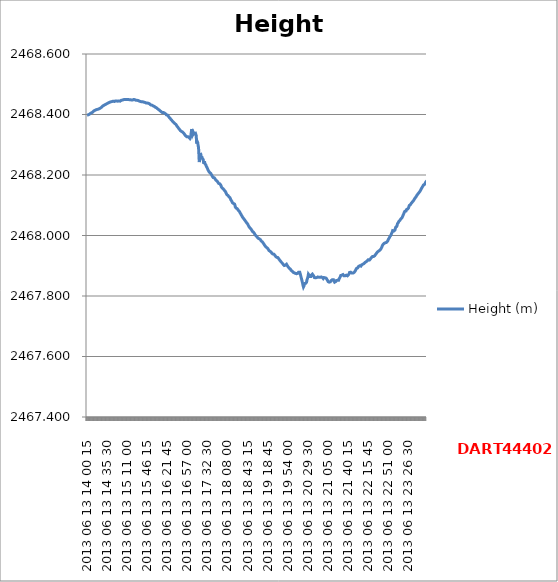
| Category | Height (m) |
|---|---|
| 2013 06 13 14 00 15 | 2468.398 |
| 2013 06 13 14 00 30 | 2468.398 |
| 2013 06 13 14 00 45 | 2468.398 |
| 2013 06 13 14 01 00 | 2468.398 |
| 2013 06 13 14 01 15 | 2468.399 |
| 2013 06 13 14 01 30 | 2468.398 |
| 2013 06 13 14 01 45 | 2468.398 |
| 2013 06 13 14 02 00 | 2468.398 |
| 2013 06 13 14 02 15 | 2468.399 |
| 2013 06 13 14 02 30 | 2468.399 |
| 2013 06 13 14 02 45 | 2468.399 |
| 2013 06 13 14 03 00 | 2468.4 |
| 2013 06 13 14 03 15 | 2468.4 |
| 2013 06 13 14 03 30 | 2468.4 |
| 2013 06 13 14 03 45 | 2468.401 |
| 2013 06 13 14 04 00 | 2468.401 |
| 2013 06 13 14 04 15 | 2468.401 |
| 2013 06 13 14 04 30 | 2468.402 |
| 2013 06 13 14 04 45 | 2468.402 |
| 2013 06 13 14 05 00 | 2468.403 |
| 2013 06 13 14 05 15 | 2468.403 |
| 2013 06 13 14 05 30 | 2468.403 |
| 2013 06 13 14 05 45 | 2468.404 |
| 2013 06 13 14 06 00 | 2468.404 |
| 2013 06 13 14 06 15 | 2468.404 |
| 2013 06 13 14 06 30 | 2468.404 |
| 2013 06 13 14 06 45 | 2468.404 |
| 2013 06 13 14 07 00 | 2468.404 |
| 2013 06 13 14 07 15 | 2468.404 |
| 2013 06 13 14 07 30 | 2468.405 |
| 2013 06 13 14 07 45 | 2468.405 |
| 2013 06 13 14 08 00 | 2468.406 |
| 2013 06 13 14 08 15 | 2468.406 |
| 2013 06 13 14 08 30 | 2468.407 |
| 2013 06 13 14 08 45 | 2468.407 |
| 2013 06 13 14 09 00 | 2468.407 |
| 2013 06 13 14 09 15 | 2468.408 |
| 2013 06 13 14 09 30 | 2468.408 |
| 2013 06 13 14 09 45 | 2468.408 |
| 2013 06 13 14 10 00 | 2468.408 |
| 2013 06 13 14 10 15 | 2468.408 |
| 2013 06 13 14 10 30 | 2468.409 |
| 2013 06 13 14 10 45 | 2468.41 |
| 2013 06 13 14 11 00 | 2468.41 |
| 2013 06 13 14 11 15 | 2468.41 |
| 2013 06 13 14 11 30 | 2468.411 |
| 2013 06 13 14 11 45 | 2468.411 |
| 2013 06 13 14 12 00 | 2468.411 |
| 2013 06 13 14 12 15 | 2468.412 |
| 2013 06 13 14 12 30 | 2468.412 |
| 2013 06 13 14 12 45 | 2468.412 |
| 2013 06 13 14 13 00 | 2468.412 |
| 2013 06 13 14 13 15 | 2468.413 |
| 2013 06 13 14 13 30 | 2468.413 |
| 2013 06 13 14 13 45 | 2468.413 |
| 2013 06 13 14 14 00 | 2468.414 |
| 2013 06 13 14 14 15 | 2468.414 |
| 2013 06 13 14 14 30 | 2468.414 |
| 2013 06 13 14 14 45 | 2468.414 |
| 2013 06 13 14 15 00 | 2468.415 |
| 2013 06 13 14 15 15 | 2468.415 |
| 2013 06 13 14 15 30 | 2468.416 |
| 2013 06 13 14 15 45 | 2468.415 |
| 2013 06 13 14 16 00 | 2468.415 |
| 2013 06 13 14 16 15 | 2468.416 |
| 2013 06 13 14 16 30 | 2468.416 |
| 2013 06 13 14 16 45 | 2468.416 |
| 2013 06 13 14 17 00 | 2468.416 |
| 2013 06 13 14 17 15 | 2468.416 |
| 2013 06 13 14 17 30 | 2468.416 |
| 2013 06 13 14 17 45 | 2468.416 |
| 2013 06 13 14 18 00 | 2468.417 |
| 2013 06 13 14 18 15 | 2468.417 |
| 2013 06 13 14 18 30 | 2468.417 |
| 2013 06 13 14 18 45 | 2468.417 |
| 2013 06 13 14 19 00 | 2468.417 |
| 2013 06 13 14 19 15 | 2468.418 |
| 2013 06 13 14 19 30 | 2468.417 |
| 2013 06 13 14 19 45 | 2468.417 |
| 2013 06 13 14 20 00 | 2468.418 |
| 2013 06 13 14 20 15 | 2468.418 |
| 2013 06 13 14 20 30 | 2468.418 |
| 2013 06 13 14 20 45 | 2468.419 |
| 2013 06 13 14 21 00 | 2468.419 |
| 2013 06 13 14 21 15 | 2468.419 |
| 2013 06 13 14 21 30 | 2468.419 |
| 2013 06 13 14 21 45 | 2468.42 |
| 2013 06 13 14 22 00 | 2468.42 |
| 2013 06 13 14 22 15 | 2468.42 |
| 2013 06 13 14 22 30 | 2468.42 |
| 2013 06 13 14 22 45 | 2468.421 |
| 2013 06 13 14 23 00 | 2468.421 |
| 2013 06 13 14 23 15 | 2468.421 |
| 2013 06 13 14 23 30 | 2468.421 |
| 2013 06 13 14 23 45 | 2468.421 |
| 2013 06 13 14 24 00 | 2468.421 |
| 2013 06 13 14 24 15 | 2468.422 |
| 2013 06 13 14 24 30 | 2468.423 |
| 2013 06 13 14 24 45 | 2468.423 |
| 2013 06 13 14 25 00 | 2468.423 |
| 2013 06 13 14 25 15 | 2468.423 |
| 2013 06 13 14 25 30 | 2468.423 |
| 2013 06 13 14 25 45 | 2468.424 |
| 2013 06 13 14 26 00 | 2468.424 |
| 2013 06 13 14 26 15 | 2468.425 |
| 2013 06 13 14 26 30 | 2468.425 |
| 2013 06 13 14 26 45 | 2468.426 |
| 2013 06 13 14 27 00 | 2468.426 |
| 2013 06 13 14 27 15 | 2468.427 |
| 2013 06 13 14 27 30 | 2468.427 |
| 2013 06 13 14 27 45 | 2468.428 |
| 2013 06 13 14 28 00 | 2468.428 |
| 2013 06 13 14 28 15 | 2468.429 |
| 2013 06 13 14 28 30 | 2468.429 |
| 2013 06 13 14 28 45 | 2468.43 |
| 2013 06 13 14 29 00 | 2468.43 |
| 2013 06 13 14 29 15 | 2468.43 |
| 2013 06 13 14 29 30 | 2468.43 |
| 2013 06 13 14 29 45 | 2468.43 |
| 2013 06 13 14 30 00 | 2468.431 |
| 2013 06 13 14 30 15 | 2468.431 |
| 2013 06 13 14 30 30 | 2468.431 |
| 2013 06 13 14 30 45 | 2468.431 |
| 2013 06 13 14 31 00 | 2468.432 |
| 2013 06 13 14 31 15 | 2468.432 |
| 2013 06 13 14 31 30 | 2468.432 |
| 2013 06 13 14 31 45 | 2468.432 |
| 2013 06 13 14 32 00 | 2468.433 |
| 2013 06 13 14 32 15 | 2468.433 |
| 2013 06 13 14 32 30 | 2468.433 |
| 2013 06 13 14 32 45 | 2468.433 |
| 2013 06 13 14 33 00 | 2468.434 |
| 2013 06 13 14 33 15 | 2468.434 |
| 2013 06 13 14 33 30 | 2468.434 |
| 2013 06 13 14 33 45 | 2468.434 |
| 2013 06 13 14 34 00 | 2468.435 |
| 2013 06 13 14 34 15 | 2468.435 |
| 2013 06 13 14 34 30 | 2468.435 |
| 2013 06 13 14 34 45 | 2468.436 |
| 2013 06 13 14 35 00 | 2468.436 |
| 2013 06 13 14 35 15 | 2468.436 |
| 2013 06 13 14 35 30 | 2468.436 |
| 2013 06 13 14 35 45 | 2468.436 |
| 2013 06 13 14 36 00 | 2468.437 |
| 2013 06 13 14 36 15 | 2468.437 |
| 2013 06 13 14 36 30 | 2468.437 |
| 2013 06 13 14 36 45 | 2468.437 |
| 2013 06 13 14 37 00 | 2468.438 |
| 2013 06 13 14 37 15 | 2468.438 |
| 2013 06 13 14 37 30 | 2468.438 |
| 2013 06 13 14 37 45 | 2468.438 |
| 2013 06 13 14 38 00 | 2468.439 |
| 2013 06 13 14 38 15 | 2468.439 |
| 2013 06 13 14 38 30 | 2468.439 |
| 2013 06 13 14 38 45 | 2468.439 |
| 2013 06 13 14 39 00 | 2468.44 |
| 2013 06 13 14 39 15 | 2468.44 |
| 2013 06 13 14 39 30 | 2468.441 |
| 2013 06 13 14 39 45 | 2468.441 |
| 2013 06 13 14 40 00 | 2468.441 |
| 2013 06 13 14 40 15 | 2468.441 |
| 2013 06 13 14 40 30 | 2468.441 |
| 2013 06 13 14 40 45 | 2468.441 |
| 2013 06 13 14 41 00 | 2468.441 |
| 2013 06 13 14 41 15 | 2468.441 |
| 2013 06 13 14 41 30 | 2468.441 |
| 2013 06 13 14 41 45 | 2468.441 |
| 2013 06 13 14 42 00 | 2468.442 |
| 2013 06 13 14 42 15 | 2468.442 |
| 2013 06 13 14 42 30 | 2468.442 |
| 2013 06 13 14 42 45 | 2468.442 |
| 2013 06 13 14 43 00 | 2468.441 |
| 2013 06 13 14 43 15 | 2468.441 |
| 2013 06 13 14 43 30 | 2468.442 |
| 2013 06 13 14 43 45 | 2468.443 |
| 2013 06 13 14 44 00 | 2468.443 |
| 2013 06 13 14 44 15 | 2468.443 |
| 2013 06 13 14 44 30 | 2468.443 |
| 2013 06 13 14 44 45 | 2468.443 |
| 2013 06 13 14 45 00 | 2468.443 |
| 2013 06 13 14 45 15 | 2468.443 |
| 2013 06 13 14 45 30 | 2468.443 |
| 2013 06 13 14 45 45 | 2468.443 |
| 2013 06 13 14 46 00 | 2468.443 |
| 2013 06 13 14 46 15 | 2468.444 |
| 2013 06 13 14 46 30 | 2468.443 |
| 2013 06 13 14 46 45 | 2468.443 |
| 2013 06 13 14 47 00 | 2468.443 |
| 2013 06 13 14 47 15 | 2468.443 |
| 2013 06 13 14 47 30 | 2468.443 |
| 2013 06 13 14 47 45 | 2468.444 |
| 2013 06 13 14 48 00 | 2468.444 |
| 2013 06 13 14 48 15 | 2468.443 |
| 2013 06 13 14 48 30 | 2468.444 |
| 2013 06 13 14 48 45 | 2468.444 |
| 2013 06 13 14 49 00 | 2468.444 |
| 2013 06 13 14 49 15 | 2468.444 |
| 2013 06 13 14 49 30 | 2468.444 |
| 2013 06 13 14 49 45 | 2468.444 |
| 2013 06 13 14 50 00 | 2468.444 |
| 2013 06 13 14 50 15 | 2468.445 |
| 2013 06 13 14 50 30 | 2468.445 |
| 2013 06 13 14 50 45 | 2468.445 |
| 2013 06 13 14 51 00 | 2468.445 |
| 2013 06 13 14 51 15 | 2468.445 |
| 2013 06 13 14 51 30 | 2468.445 |
| 2013 06 13 14 51 45 | 2468.445 |
| 2013 06 13 14 52 00 | 2468.445 |
| 2013 06 13 14 52 15 | 2468.445 |
| 2013 06 13 14 52 30 | 2468.444 |
| 2013 06 13 14 52 45 | 2468.444 |
| 2013 06 13 14 53 00 | 2468.444 |
| 2013 06 13 14 53 15 | 2468.444 |
| 2013 06 13 14 53 30 | 2468.445 |
| 2013 06 13 14 53 45 | 2468.444 |
| 2013 06 13 14 54 00 | 2468.444 |
| 2013 06 13 14 54 15 | 2468.444 |
| 2013 06 13 14 54 30 | 2468.445 |
| 2013 06 13 14 54 45 | 2468.445 |
| 2013 06 13 14 55 00 | 2468.445 |
| 2013 06 13 14 55 15 | 2468.444 |
| 2013 06 13 14 55 30 | 2468.444 |
| 2013 06 13 14 55 45 | 2468.444 |
| 2013 06 13 14 56 00 | 2468.445 |
| 2013 06 13 14 56 15 | 2468.445 |
| 2013 06 13 14 56 30 | 2468.445 |
| 2013 06 13 14 56 45 | 2468.444 |
| 2013 06 13 14 57 00 | 2468.444 |
| 2013 06 13 14 57 15 | 2468.444 |
| 2013 06 13 14 57 30 | 2468.444 |
| 2013 06 13 14 57 45 | 2468.444 |
| 2013 06 13 14 58 00 | 2468.444 |
| 2013 06 13 14 58 15 | 2468.444 |
| 2013 06 13 14 58 30 | 2468.444 |
| 2013 06 13 14 58 45 | 2468.445 |
| 2013 06 13 14 59 00 | 2468.446 |
| 2013 06 13 14 59 15 | 2468.445 |
| 2013 06 13 14 59 30 | 2468.446 |
| 2013 06 13 14 59 45 | 2468.446 |
| 2013 06 13 15 00 15 | 2468.447 |
| 2013 06 13 15 00 30 | 2468.447 |
| 2013 06 13 15 00 45 | 2468.447 |
| 2013 06 13 15 01 00 | 2468.448 |
| 2013 06 13 15 01 15 | 2468.448 |
| 2013 06 13 15 01 30 | 2468.447 |
| 2013 06 13 15 01 45 | 2468.448 |
| 2013 06 13 15 02 00 | 2468.448 |
| 2013 06 13 15 02 15 | 2468.448 |
| 2013 06 13 15 02 30 | 2468.448 |
| 2013 06 13 15 02 45 | 2468.448 |
| 2013 06 13 15 03 00 | 2468.448 |
| 2013 06 13 15 03 15 | 2468.448 |
| 2013 06 13 15 03 30 | 2468.448 |
| 2013 06 13 15 03 45 | 2468.448 |
| 2013 06 13 15 04 00 | 2468.448 |
| 2013 06 13 15 04 15 | 2468.448 |
| 2013 06 13 15 04 30 | 2468.449 |
| 2013 06 13 15 04 45 | 2468.449 |
| 2013 06 13 15 05 00 | 2468.449 |
| 2013 06 13 15 05 15 | 2468.449 |
| 2013 06 13 15 05 30 | 2468.45 |
| 2013 06 13 15 05 45 | 2468.45 |
| 2013 06 13 15 06 00 | 2468.45 |
| 2013 06 13 15 06 15 | 2468.45 |
| 2013 06 13 15 06 30 | 2468.45 |
| 2013 06 13 15 06 45 | 2468.45 |
| 2013 06 13 15 07 00 | 2468.45 |
| 2013 06 13 15 07 15 | 2468.45 |
| 2013 06 13 15 07 30 | 2468.45 |
| 2013 06 13 15 07 45 | 2468.45 |
| 2013 06 13 15 08 00 | 2468.45 |
| 2013 06 13 15 08 15 | 2468.45 |
| 2013 06 13 15 08 30 | 2468.45 |
| 2013 06 13 15 08 45 | 2468.45 |
| 2013 06 13 15 09 00 | 2468.45 |
| 2013 06 13 15 09 15 | 2468.45 |
| 2013 06 13 15 09 30 | 2468.45 |
| 2013 06 13 15 09 45 | 2468.45 |
| 2013 06 13 15 10 00 | 2468.45 |
| 2013 06 13 15 10 15 | 2468.45 |
| 2013 06 13 15 10 30 | 2468.45 |
| 2013 06 13 15 10 45 | 2468.45 |
| 2013 06 13 15 11 00 | 2468.45 |
| 2013 06 13 15 11 15 | 2468.45 |
| 2013 06 13 15 11 30 | 2468.45 |
| 2013 06 13 15 11 45 | 2468.45 |
| 2013 06 13 15 12 00 | 2468.45 |
| 2013 06 13 15 12 15 | 2468.45 |
| 2013 06 13 15 12 30 | 2468.45 |
| 2013 06 13 15 12 45 | 2468.45 |
| 2013 06 13 15 13 00 | 2468.45 |
| 2013 06 13 15 13 15 | 2468.45 |
| 2013 06 13 15 13 30 | 2468.45 |
| 2013 06 13 15 13 45 | 2468.45 |
| 2013 06 13 15 14 00 | 2468.45 |
| 2013 06 13 15 14 15 | 2468.449 |
| 2013 06 13 15 14 30 | 2468.449 |
| 2013 06 13 15 14 45 | 2468.45 |
| 2013 06 13 15 15 00 | 2468.45 |
| 2013 06 13 15 15 15 | 2468.449 |
| 2013 06 13 15 15 30 | 2468.449 |
| 2013 06 13 15 15 45 | 2468.449 |
| 2013 06 13 15 16 00 | 2468.45 |
| 2013 06 13 15 16 15 | 2468.45 |
| 2013 06 13 15 16 30 | 2468.449 |
| 2013 06 13 15 16 45 | 2468.45 |
| 2013 06 13 15 17 00 | 2468.449 |
| 2013 06 13 15 17 15 | 2468.449 |
| 2013 06 13 15 17 30 | 2468.449 |
| 2013 06 13 15 17 45 | 2468.449 |
| 2013 06 13 15 18 00 | 2468.449 |
| 2013 06 13 15 18 15 | 2468.448 |
| 2013 06 13 15 18 30 | 2468.448 |
| 2013 06 13 15 18 45 | 2468.448 |
| 2013 06 13 15 19 00 | 2468.448 |
| 2013 06 13 15 19 15 | 2468.448 |
| 2013 06 13 15 19 30 | 2468.448 |
| 2013 06 13 15 19 45 | 2468.448 |
| 2013 06 13 15 20 00 | 2468.448 |
| 2013 06 13 15 20 15 | 2468.448 |
| 2013 06 13 15 20 30 | 2468.448 |
| 2013 06 13 15 20 45 | 2468.448 |
| 2013 06 13 15 21 00 | 2468.448 |
| 2013 06 13 15 21 15 | 2468.448 |
| 2013 06 13 15 21 30 | 2468.448 |
| 2013 06 13 15 21 45 | 2468.449 |
| 2013 06 13 15 22 00 | 2468.449 |
| 2013 06 13 15 22 15 | 2468.449 |
| 2013 06 13 15 22 30 | 2468.45 |
| 2013 06 13 15 22 45 | 2468.45 |
| 2013 06 13 15 23 00 | 2468.45 |
| 2013 06 13 15 23 15 | 2468.45 |
| 2013 06 13 15 23 30 | 2468.45 |
| 2013 06 13 15 23 45 | 2468.45 |
| 2013 06 13 15 24 00 | 2468.449 |
| 2013 06 13 15 24 15 | 2468.449 |
| 2013 06 13 15 24 30 | 2468.449 |
| 2013 06 13 15 24 45 | 2468.449 |
| 2013 06 13 15 25 00 | 2468.448 |
| 2013 06 13 15 25 15 | 2468.448 |
| 2013 06 13 15 25 30 | 2468.448 |
| 2013 06 13 15 25 45 | 2468.448 |
| 2013 06 13 15 26 00 | 2468.448 |
| 2013 06 13 15 26 15 | 2468.448 |
| 2013 06 13 15 26 30 | 2468.447 |
| 2013 06 13 15 26 45 | 2468.447 |
| 2013 06 13 15 27 00 | 2468.447 |
| 2013 06 13 15 27 15 | 2468.447 |
| 2013 06 13 15 27 30 | 2468.447 |
| 2013 06 13 15 27 45 | 2468.447 |
| 2013 06 13 15 28 00 | 2468.447 |
| 2013 06 13 15 28 15 | 2468.447 |
| 2013 06 13 15 28 30 | 2468.447 |
| 2013 06 13 15 28 45 | 2468.447 |
| 2013 06 13 15 29 00 | 2468.447 |
| 2013 06 13 15 29 15 | 2468.446 |
| 2013 06 13 15 29 30 | 2468.447 |
| 2013 06 13 15 29 45 | 2468.446 |
| 2013 06 13 15 30 00 | 2468.446 |
| 2013 06 13 15 30 15 | 2468.446 |
| 2013 06 13 15 30 30 | 2468.446 |
| 2013 06 13 15 30 45 | 2468.445 |
| 2013 06 13 15 31 00 | 2468.445 |
| 2013 06 13 15 31 15 | 2468.445 |
| 2013 06 13 15 31 30 | 2468.445 |
| 2013 06 13 15 31 45 | 2468.445 |
| 2013 06 13 15 32 00 | 2468.444 |
| 2013 06 13 15 32 15 | 2468.444 |
| 2013 06 13 15 32 30 | 2468.444 |
| 2013 06 13 15 32 45 | 2468.444 |
| 2013 06 13 15 33 00 | 2468.443 |
| 2013 06 13 15 33 15 | 2468.443 |
| 2013 06 13 15 33 30 | 2468.443 |
| 2013 06 13 15 33 45 | 2468.443 |
| 2013 06 13 15 34 00 | 2468.443 |
| 2013 06 13 15 34 15 | 2468.443 |
| 2013 06 13 15 34 30 | 2468.443 |
| 2013 06 13 15 34 45 | 2468.442 |
| 2013 06 13 15 35 00 | 2468.443 |
| 2013 06 13 15 35 15 | 2468.443 |
| 2013 06 13 15 35 30 | 2468.443 |
| 2013 06 13 15 35 45 | 2468.443 |
| 2013 06 13 15 36 00 | 2468.442 |
| 2013 06 13 15 36 15 | 2468.442 |
| 2013 06 13 15 36 30 | 2468.442 |
| 2013 06 13 15 36 45 | 2468.442 |
| 2013 06 13 15 37 00 | 2468.442 |
| 2013 06 13 15 37 15 | 2468.442 |
| 2013 06 13 15 37 30 | 2468.442 |
| 2013 06 13 15 37 45 | 2468.442 |
| 2013 06 13 15 38 00 | 2468.442 |
| 2013 06 13 15 38 15 | 2468.442 |
| 2013 06 13 15 38 30 | 2468.442 |
| 2013 06 13 15 38 45 | 2468.442 |
| 2013 06 13 15 39 00 | 2468.442 |
| 2013 06 13 15 39 15 | 2468.441 |
| 2013 06 13 15 39 30 | 2468.441 |
| 2013 06 13 15 39 45 | 2468.442 |
| 2013 06 13 15 40 00 | 2468.442 |
| 2013 06 13 15 40 15 | 2468.442 |
| 2013 06 13 15 40 30 | 2468.441 |
| 2013 06 13 15 40 45 | 2468.441 |
| 2013 06 13 15 41 00 | 2468.441 |
| 2013 06 13 15 41 15 | 2468.441 |
| 2013 06 13 15 41 30 | 2468.441 |
| 2013 06 13 15 41 45 | 2468.44 |
| 2013 06 13 15 42 00 | 2468.441 |
| 2013 06 13 15 42 15 | 2468.441 |
| 2013 06 13 15 42 30 | 2468.44 |
| 2013 06 13 15 42 45 | 2468.44 |
| 2013 06 13 15 43 00 | 2468.439 |
| 2013 06 13 15 43 15 | 2468.439 |
| 2013 06 13 15 43 30 | 2468.439 |
| 2013 06 13 15 43 45 | 2468.439 |
| 2013 06 13 15 44 00 | 2468.438 |
| 2013 06 13 15 44 15 | 2468.438 |
| 2013 06 13 15 44 30 | 2468.438 |
| 2013 06 13 15 44 45 | 2468.438 |
| 2013 06 13 15 45 00 | 2468.438 |
| 2013 06 13 15 45 15 | 2468.438 |
| 2013 06 13 15 45 30 | 2468.438 |
| 2013 06 13 15 45 45 | 2468.438 |
| 2013 06 13 15 46 00 | 2468.437 |
| 2013 06 13 15 46 15 | 2468.437 |
| 2013 06 13 15 46 30 | 2468.438 |
| 2013 06 13 15 46 45 | 2468.438 |
| 2013 06 13 15 47 00 | 2468.437 |
| 2013 06 13 15 47 15 | 2468.437 |
| 2013 06 13 15 47 30 | 2468.436 |
| 2013 06 13 15 47 45 | 2468.436 |
| 2013 06 13 15 48 00 | 2468.437 |
| 2013 06 13 15 48 15 | 2468.437 |
| 2013 06 13 15 48 30 | 2468.437 |
| 2013 06 13 15 48 45 | 2468.436 |
| 2013 06 13 15 49 00 | 2468.436 |
| 2013 06 13 15 49 15 | 2468.436 |
| 2013 06 13 15 49 30 | 2468.436 |
| 2013 06 13 15 49 45 | 2468.436 |
| 2013 06 13 15 50 00 | 2468.436 |
| 2013 06 13 15 50 15 | 2468.435 |
| 2013 06 13 15 50 30 | 2468.435 |
| 2013 06 13 15 50 45 | 2468.435 |
| 2013 06 13 15 51 00 | 2468.434 |
| 2013 06 13 15 51 15 | 2468.433 |
| 2013 06 13 15 51 30 | 2468.433 |
| 2013 06 13 15 51 45 | 2468.433 |
| 2013 06 13 15 52 00 | 2468.433 |
| 2013 06 13 15 52 15 | 2468.433 |
| 2013 06 13 15 52 30 | 2468.432 |
| 2013 06 13 15 52 45 | 2468.432 |
| 2013 06 13 15 53 00 | 2468.432 |
| 2013 06 13 15 53 15 | 2468.432 |
| 2013 06 13 15 53 30 | 2468.432 |
| 2013 06 13 15 53 45 | 2468.432 |
| 2013 06 13 15 54 00 | 2468.432 |
| 2013 06 13 15 54 15 | 2468.431 |
| 2013 06 13 15 54 30 | 2468.431 |
| 2013 06 13 15 54 45 | 2468.431 |
| 2013 06 13 15 55 00 | 2468.431 |
| 2013 06 13 15 55 15 | 2468.43 |
| 2013 06 13 15 55 30 | 2468.43 |
| 2013 06 13 15 55 45 | 2468.431 |
| 2013 06 13 15 56 00 | 2468.43 |
| 2013 06 13 15 56 15 | 2468.43 |
| 2013 06 13 15 56 30 | 2468.429 |
| 2013 06 13 15 56 45 | 2468.429 |
| 2013 06 13 15 57 00 | 2468.429 |
| 2013 06 13 15 57 15 | 2468.428 |
| 2013 06 13 15 57 30 | 2468.428 |
| 2013 06 13 15 57 45 | 2468.428 |
| 2013 06 13 15 58 00 | 2468.428 |
| 2013 06 13 15 58 15 | 2468.427 |
| 2013 06 13 15 58 30 | 2468.427 |
| 2013 06 13 15 58 45 | 2468.426 |
| 2013 06 13 15 59 00 | 2468.426 |
| 2013 06 13 15 59 15 | 2468.426 |
| 2013 06 13 15 59 30 | 2468.425 |
| 2013 06 13 15 59 45 | 2468.424 |
| 2013 06 13 16 00 15 | 2468.424 |
| 2013 06 13 16 00 30 | 2468.424 |
| 2013 06 13 16 00 45 | 2468.424 |
| 2013 06 13 16 01 00 | 2468.424 |
| 2013 06 13 16 01 15 | 2468.423 |
| 2013 06 13 16 01 30 | 2468.423 |
| 2013 06 13 16 01 45 | 2468.423 |
| 2013 06 13 16 02 00 | 2468.422 |
| 2013 06 13 16 02 15 | 2468.422 |
| 2013 06 13 16 02 30 | 2468.422 |
| 2013 06 13 16 02 45 | 2468.422 |
| 2013 06 13 16 03 00 | 2468.421 |
| 2013 06 13 16 03 15 | 2468.42 |
| 2013 06 13 16 03 30 | 2468.42 |
| 2013 06 13 16 03 45 | 2468.42 |
| 2013 06 13 16 04 00 | 2468.419 |
| 2013 06 13 16 04 15 | 2468.419 |
| 2013 06 13 16 04 30 | 2468.419 |
| 2013 06 13 16 04 45 | 2468.419 |
| 2013 06 13 16 05 00 | 2468.418 |
| 2013 06 13 16 05 15 | 2468.418 |
| 2013 06 13 16 05 30 | 2468.417 |
| 2013 06 13 16 05 45 | 2468.416 |
| 2013 06 13 16 06 00 | 2468.416 |
| 2013 06 13 16 06 15 | 2468.416 |
| 2013 06 13 16 06 30 | 2468.416 |
| 2013 06 13 16 06 45 | 2468.416 |
| 2013 06 13 16 07 00 | 2468.415 |
| 2013 06 13 16 07 15 | 2468.415 |
| 2013 06 13 16 07 30 | 2468.415 |
| 2013 06 13 16 07 45 | 2468.415 |
| 2013 06 13 16 08 00 | 2468.414 |
| 2013 06 13 16 08 15 | 2468.414 |
| 2013 06 13 16 08 30 | 2468.414 |
| 2013 06 13 16 08 45 | 2468.413 |
| 2013 06 13 16 09 00 | 2468.412 |
| 2013 06 13 16 09 15 | 2468.413 |
| 2013 06 13 16 09 30 | 2468.412 |
| 2013 06 13 16 09 45 | 2468.411 |
| 2013 06 13 16 10 00 | 2468.411 |
| 2013 06 13 16 10 15 | 2468.411 |
| 2013 06 13 16 10 30 | 2468.41 |
| 2013 06 13 16 10 45 | 2468.41 |
| 2013 06 13 16 11 00 | 2468.409 |
| 2013 06 13 16 11 15 | 2468.409 |
| 2013 06 13 16 11 30 | 2468.408 |
| 2013 06 13 16 11 45 | 2468.408 |
| 2013 06 13 16 12 00 | 2468.408 |
| 2013 06 13 16 12 15 | 2468.408 |
| 2013 06 13 16 12 30 | 2468.407 |
| 2013 06 13 16 12 45 | 2468.407 |
| 2013 06 13 16 13 00 | 2468.407 |
| 2013 06 13 16 13 15 | 2468.407 |
| 2013 06 13 16 13 30 | 2468.407 |
| 2013 06 13 16 13 45 | 2468.407 |
| 2013 06 13 16 14 00 | 2468.407 |
| 2013 06 13 16 14 15 | 2468.407 |
| 2013 06 13 16 14 30 | 2468.407 |
| 2013 06 13 16 14 45 | 2468.407 |
| 2013 06 13 16 15 00 | 2468.407 |
| 2013 06 13 16 15 15 | 2468.406 |
| 2013 06 13 16 15 30 | 2468.406 |
| 2013 06 13 16 15 45 | 2468.406 |
| 2013 06 13 16 16 00 | 2468.406 |
| 2013 06 13 16 16 15 | 2468.406 |
| 2013 06 13 16 16 30 | 2468.406 |
| 2013 06 13 16 16 45 | 2468.405 |
| 2013 06 13 16 17 00 | 2468.405 |
| 2013 06 13 16 17 15 | 2468.405 |
| 2013 06 13 16 17 30 | 2468.405 |
| 2013 06 13 16 17 45 | 2468.404 |
| 2013 06 13 16 18 00 | 2468.404 |
| 2013 06 13 16 18 15 | 2468.403 |
| 2013 06 13 16 18 30 | 2468.402 |
| 2013 06 13 16 18 45 | 2468.402 |
| 2013 06 13 16 19 00 | 2468.402 |
| 2013 06 13 16 19 15 | 2468.401 |
| 2013 06 13 16 19 30 | 2468.401 |
| 2013 06 13 16 19 45 | 2468.401 |
| 2013 06 13 16 20 00 | 2468.4 |
| 2013 06 13 16 20 15 | 2468.399 |
| 2013 06 13 16 20 30 | 2468.399 |
| 2013 06 13 16 20 45 | 2468.399 |
| 2013 06 13 16 21 00 | 2468.399 |
| 2013 06 13 16 21 15 | 2468.399 |
| 2013 06 13 16 21 30 | 2468.398 |
| 2013 06 13 16 21 45 | 2468.398 |
| 2013 06 13 16 22 00 | 2468.398 |
| 2013 06 13 16 22 15 | 2468.398 |
| 2013 06 13 16 22 30 | 2468.397 |
| 2013 06 13 16 22 45 | 2468.396 |
| 2013 06 13 16 23 00 | 2468.396 |
| 2013 06 13 16 23 15 | 2468.396 |
| 2013 06 13 16 23 30 | 2468.395 |
| 2013 06 13 16 23 45 | 2468.394 |
| 2013 06 13 16 24 00 | 2468.394 |
| 2013 06 13 16 24 15 | 2468.394 |
| 2013 06 13 16 24 30 | 2468.393 |
| 2013 06 13 16 24 45 | 2468.392 |
| 2013 06 13 16 25 00 | 2468.391 |
| 2013 06 13 16 25 15 | 2468.391 |
| 2013 06 13 16 25 30 | 2468.39 |
| 2013 06 13 16 25 45 | 2468.39 |
| 2013 06 13 16 26 00 | 2468.389 |
| 2013 06 13 16 26 15 | 2468.389 |
| 2013 06 13 16 26 30 | 2468.388 |
| 2013 06 13 16 26 45 | 2468.388 |
| 2013 06 13 16 27 00 | 2468.387 |
| 2013 06 13 16 27 15 | 2468.386 |
| 2013 06 13 16 27 30 | 2468.385 |
| 2013 06 13 16 27 45 | 2468.385 |
| 2013 06 13 16 28 00 | 2468.385 |
| 2013 06 13 16 28 15 | 2468.384 |
| 2013 06 13 16 28 30 | 2468.383 |
| 2013 06 13 16 28 45 | 2468.383 |
| 2013 06 13 16 29 00 | 2468.382 |
| 2013 06 13 16 29 15 | 2468.382 |
| 2013 06 13 16 29 30 | 2468.381 |
| 2013 06 13 16 29 45 | 2468.381 |
| 2013 06 13 16 30 00 | 2468.381 |
| 2013 06 13 16 30 15 | 2468.38 |
| 2013 06 13 16 30 30 | 2468.38 |
| 2013 06 13 16 30 45 | 2468.379 |
| 2013 06 13 16 31 00 | 2468.378 |
| 2013 06 13 16 31 15 | 2468.377 |
| 2013 06 13 16 31 30 | 2468.377 |
| 2013 06 13 16 31 45 | 2468.377 |
| 2013 06 13 16 32 00 | 2468.376 |
| 2013 06 13 16 32 15 | 2468.376 |
| 2013 06 13 16 32 30 | 2468.375 |
| 2013 06 13 16 32 45 | 2468.375 |
| 2013 06 13 16 33 00 | 2468.374 |
| 2013 06 13 16 33 15 | 2468.374 |
| 2013 06 13 16 33 30 | 2468.373 |
| 2013 06 13 16 33 45 | 2468.373 |
| 2013 06 13 16 34 00 | 2468.373 |
| 2013 06 13 16 34 15 | 2468.373 |
| 2013 06 13 16 34 30 | 2468.372 |
| 2013 06 13 16 34 45 | 2468.372 |
| 2013 06 13 16 35 00 | 2468.37 |
| 2013 06 13 16 35 15 | 2468.37 |
| 2013 06 13 16 35 30 | 2468.37 |
| 2013 06 13 16 35 45 | 2468.369 |
| 2013 06 13 16 36 00 | 2468.368 |
| 2013 06 13 16 36 15 | 2468.368 |
| 2013 06 13 16 36 30 | 2468.367 |
| 2013 06 13 16 36 45 | 2468.367 |
| 2013 06 13 16 37 00 | 2468.367 |
| 2013 06 13 16 37 15 | 2468.366 |
| 2013 06 13 16 37 30 | 2468.366 |
| 2013 06 13 16 37 45 | 2468.365 |
| 2013 06 13 16 38 00 | 2468.365 |
| 2013 06 13 16 38 15 | 2468.363 |
| 2013 06 13 16 38 30 | 2468.363 |
| 2013 06 13 16 38 45 | 2468.363 |
| 2013 06 13 16 39 00 | 2468.363 |
| 2013 06 13 16 39 15 | 2468.362 |
| 2013 06 13 16 39 30 | 2468.361 |
| 2013 06 13 16 39 45 | 2468.361 |
| 2013 06 13 16 40 00 | 2468.359 |
| 2013 06 13 16 40 15 | 2468.358 |
| 2013 06 13 16 40 30 | 2468.358 |
| 2013 06 13 16 40 45 | 2468.357 |
| 2013 06 13 16 41 00 | 2468.357 |
| 2013 06 13 16 41 15 | 2468.356 |
| 2013 06 13 16 41 30 | 2468.356 |
| 2013 06 13 16 41 45 | 2468.354 |
| 2013 06 13 16 42 00 | 2468.354 |
| 2013 06 13 16 42 15 | 2468.353 |
| 2013 06 13 16 42 30 | 2468.352 |
| 2013 06 13 16 42 45 | 2468.352 |
| 2013 06 13 16 43 00 | 2468.352 |
| 2013 06 13 16 43 15 | 2468.351 |
| 2013 06 13 16 43 30 | 2468.35 |
| 2013 06 13 16 43 45 | 2468.349 |
| 2013 06 13 16 44 00 | 2468.348 |
| 2013 06 13 16 44 15 | 2468.348 |
| 2013 06 13 16 44 30 | 2468.348 |
| 2013 06 13 16 44 45 | 2468.347 |
| 2013 06 13 16 45 00 | 2468.346 |
| 2013 06 13 16 45 15 | 2468.346 |
| 2013 06 13 16 45 30 | 2468.345 |
| 2013 06 13 16 45 45 | 2468.345 |
| 2013 06 13 16 46 00 | 2468.345 |
| 2013 06 13 16 46 15 | 2468.344 |
| 2013 06 13 16 46 30 | 2468.344 |
| 2013 06 13 16 46 45 | 2468.344 |
| 2013 06 13 16 47 00 | 2468.343 |
| 2013 06 13 16 47 15 | 2468.343 |
| 2013 06 13 16 47 30 | 2468.343 |
| 2013 06 13 16 47 45 | 2468.342 |
| 2013 06 13 16 48 00 | 2468.342 |
| 2013 06 13 16 48 15 | 2468.342 |
| 2013 06 13 16 48 30 | 2468.342 |
| 2013 06 13 16 48 45 | 2468.342 |
| 2013 06 13 16 49 00 | 2468.342 |
| 2013 06 13 16 49 15 | 2468.341 |
| 2013 06 13 16 49 30 | 2468.341 |
| 2013 06 13 16 49 45 | 2468.34 |
| 2013 06 13 16 50 00 | 2468.34 |
| 2013 06 13 16 50 15 | 2468.339 |
| 2013 06 13 16 50 30 | 2468.339 |
| 2013 06 13 16 50 45 | 2468.338 |
| 2013 06 13 16 51 00 | 2468.338 |
| 2013 06 13 16 51 15 | 2468.337 |
| 2013 06 13 16 51 30 | 2468.336 |
| 2013 06 13 16 51 45 | 2468.336 |
| 2013 06 13 16 52 00 | 2468.335 |
| 2013 06 13 16 52 15 | 2468.334 |
| 2013 06 13 16 52 30 | 2468.334 |
| 2013 06 13 16 52 45 | 2468.333 |
| 2013 06 13 16 53 00 | 2468.332 |
| 2013 06 13 16 53 15 | 2468.332 |
| 2013 06 13 16 53 30 | 2468.331 |
| 2013 06 13 16 53 45 | 2468.33 |
| 2013 06 13 16 54 00 | 2468.33 |
| 2013 06 13 16 54 15 | 2468.329 |
| 2013 06 13 16 54 30 | 2468.329 |
| 2013 06 13 16 54 45 | 2468.329 |
| 2013 06 13 16 55 00 | 2468.328 |
| 2013 06 13 16 55 15 | 2468.328 |
| 2013 06 13 16 55 30 | 2468.327 |
| 2013 06 13 16 55 45 | 2468.327 |
| 2013 06 13 16 56 00 | 2468.327 |
| 2013 06 13 16 56 15 | 2468.327 |
| 2013 06 13 16 56 30 | 2468.327 |
| 2013 06 13 16 56 45 | 2468.327 |
| 2013 06 13 16 57 00 | 2468.327 |
| 2013 06 13 16 57 15 | 2468.327 |
| 2013 06 13 16 57 30 | 2468.327 |
| 2013 06 13 16 57 45 | 2468.327 |
| 2013 06 13 16 58 00 | 2468.327 |
| 2013 06 13 16 58 15 | 2468.327 |
| 2013 06 13 16 58 30 | 2468.327 |
| 2013 06 13 16 58 45 | 2468.326 |
| 2013 06 13 16 59 00 | 2468.326 |
| 2013 06 13 16 59 15 | 2468.325 |
| 2013 06 13 16 59 30 | 2468.325 |
| 2013 06 13 16 59 45 | 2468.325 |
| 2013 06 13 17 00 15 | 2468.323 |
| 2013 06 13 17 00 30 | 2468.323 |
| 2013 06 13 17 00 45 | 2468.323 |
| 2013 06 13 17 01 00 | 2468.322 |
| 2013 06 13 17 01 15 | 2468.322 |
| 2013 06 13 17 01 30 | 2468.322 |
| 2013 06 13 17 01 45 | 2468.321 |
| 2013 06 13 17 02 00 | 2468.322 |
| 2013 06 13 17 02 15 | 2468.323 |
| 2013 06 13 17 02 30 | 2468.324 |
| 2013 06 13 17 02 45 | 2468.325 |
| 2013 06 13 17 03 00 | 2468.327 |
| 2013 06 13 17 03 15 | 2468.329 |
| 2013 06 13 17 03 30 | 2468.332 |
| 2013 06 13 17 03 45 | 2468.336 |
| 2013 06 13 17 04 00 | 2468.34 |
| 2013 06 13 17 04 15 | 2468.343 |
| 2013 06 13 17 04 30 | 2468.346 |
| 2013 06 13 17 04 45 | 2468.349 |
| 2013 06 13 17 05 00 | 2468.352 |
| 2013 06 13 17 05 15 | 2468.352 |
| 2013 06 13 17 05 30 | 2468.352 |
| 2013 06 13 17 05 45 | 2468.35 |
| 2013 06 13 17 06 00 | 2468.346 |
| 2013 06 13 17 06 15 | 2468.342 |
| 2013 06 13 17 06 30 | 2468.338 |
| 2013 06 13 17 06 45 | 2468.334 |
| 2013 06 13 17 07 00 | 2468.331 |
| 2013 06 13 17 07 15 | 2468.331 |
| 2013 06 13 17 07 30 | 2468.331 |
| 2013 06 13 17 07 45 | 2468.334 |
| 2013 06 13 17 08 00 | 2468.337 |
| 2013 06 13 17 08 15 | 2468.34 |
| 2013 06 13 17 08 30 | 2468.34 |
| 2013 06 13 17 08 45 | 2468.339 |
| 2013 06 13 17 09 00 | 2468.338 |
| 2013 06 13 17 09 15 | 2468.337 |
| 2013 06 13 17 09 30 | 2468.336 |
| 2013 06 13 17 09 45 | 2468.335 |
| 2013 06 13 17 10 00 | 2468.336 |
| 2013 06 13 17 10 15 | 2468.336 |
| 2013 06 13 17 10 30 | 2468.338 |
| 2013 06 13 17 10 45 | 2468.338 |
| 2013 06 13 17 11 00 | 2468.338 |
| 2013 06 13 17 11 15 | 2468.337 |
| 2013 06 13 17 11 30 | 2468.338 |
| 2013 06 13 17 11 45 | 2468.339 |
| 2013 06 13 17 12 00 | 2468.339 |
| 2013 06 13 17 12 15 | 2468.339 |
| 2013 06 13 17 12 30 | 2468.336 |
| 2013 06 13 17 12 45 | 2468.331 |
| 2013 06 13 17 13 00 | 2468.324 |
| 2013 06 13 17 13 15 | 2468.316 |
| 2013 06 13 17 13 30 | 2468.309 |
| 2013 06 13 17 13 45 | 2468.304 |
| 2013 06 13 17 14 00 | 2468.303 |
| 2013 06 13 17 14 15 | 2468.304 |
| 2013 06 13 17 14 30 | 2468.307 |
| 2013 06 13 17 14 45 | 2468.31 |
| 2013 06 13 17 15 00 | 2468.311 |
| 2013 06 13 17 15 15 | 2468.31 |
| 2013 06 13 17 15 30 | 2468.307 |
| 2013 06 13 17 15 45 | 2468.303 |
| 2013 06 13 17 16 00 | 2468.3 |
| 2013 06 13 17 16 15 | 2468.297 |
| 2013 06 13 17 16 30 | 2468.295 |
| 2013 06 13 17 16 45 | 2468.292 |
| 2013 06 13 17 17 00 | 2468.287 |
| 2013 06 13 17 17 15 | 2468.279 |
| 2013 06 13 17 17 30 | 2468.269 |
| 2013 06 13 17 17 45 | 2468.258 |
| 2013 06 13 17 18 00 | 2468.249 |
| 2013 06 13 17 18 15 | 2468.243 |
| 2013 06 13 17 18 30 | 2468.243 |
| 2013 06 13 17 18 45 | 2468.248 |
| 2013 06 13 17 19 00 | 2468.253 |
| 2013 06 13 17 19 15 | 2468.258 |
| 2013 06 13 17 19 30 | 2468.262 |
| 2013 06 13 17 19 45 | 2468.265 |
| 2013 06 13 17 20 00 | 2468.269 |
| 2013 06 13 17 20 15 | 2468.273 |
| 2013 06 13 17 20 30 | 2468.274 |
| 2013 06 13 17 20 45 | 2468.271 |
| 2013 06 13 17 21 00 | 2468.266 |
| 2013 06 13 17 21 15 | 2468.258 |
| 2013 06 13 17 21 30 | 2468.254 |
| 2013 06 13 17 21 45 | 2468.254 |
| 2013 06 13 17 22 00 | 2468.258 |
| 2013 06 13 17 22 15 | 2468.262 |
| 2013 06 13 17 22 30 | 2468.262 |
| 2013 06 13 17 22 45 | 2468.26 |
| 2013 06 13 17 23 00 | 2468.256 |
| 2013 06 13 17 23 15 | 2468.254 |
| 2013 06 13 17 23 30 | 2468.254 |
| 2013 06 13 17 23 45 | 2468.255 |
| 2013 06 13 17 24 00 | 2468.256 |
| 2013 06 13 17 24 15 | 2468.256 |
| 2013 06 13 17 24 30 | 2468.255 |
| 2013 06 13 17 24 45 | 2468.255 |
| 2013 06 13 17 25 00 | 2468.252 |
| 2013 06 13 17 25 15 | 2468.249 |
| 2013 06 13 17 25 30 | 2468.245 |
| 2013 06 13 17 25 45 | 2468.242 |
| 2013 06 13 17 26 00 | 2468.241 |
| 2013 06 13 17 26 15 | 2468.242 |
| 2013 06 13 17 26 30 | 2468.242 |
| 2013 06 13 17 26 45 | 2468.242 |
| 2013 06 13 17 27 00 | 2468.243 |
| 2013 06 13 17 27 15 | 2468.244 |
| 2013 06 13 17 27 30 | 2468.244 |
| 2013 06 13 17 27 45 | 2468.242 |
| 2013 06 13 17 28 00 | 2468.239 |
| 2013 06 13 17 28 15 | 2468.237 |
| 2013 06 13 17 28 30 | 2468.237 |
| 2013 06 13 17 28 45 | 2468.238 |
| 2013 06 13 17 29 00 | 2468.238 |
| 2013 06 13 17 29 15 | 2468.237 |
| 2013 06 13 17 29 30 | 2468.235 |
| 2013 06 13 17 29 45 | 2468.235 |
| 2013 06 13 17 30 00 | 2468.233 |
| 2013 06 13 17 30 15 | 2468.231 |
| 2013 06 13 17 30 30 | 2468.229 |
| 2013 06 13 17 30 45 | 2468.228 |
| 2013 06 13 17 31 00 | 2468.229 |
| 2013 06 13 17 31 15 | 2468.229 |
| 2013 06 13 17 31 30 | 2468.227 |
| 2013 06 13 17 31 45 | 2468.225 |
| 2013 06 13 17 32 00 | 2468.223 |
| 2013 06 13 17 32 15 | 2468.223 |
| 2013 06 13 17 32 30 | 2468.222 |
| 2013 06 13 17 32 45 | 2468.221 |
| 2013 06 13 17 33 00 | 2468.22 |
| 2013 06 13 17 33 15 | 2468.218 |
| 2013 06 13 17 33 30 | 2468.217 |
| 2013 06 13 17 33 45 | 2468.216 |
| 2013 06 13 17 34 00 | 2468.216 |
| 2013 06 13 17 34 15 | 2468.216 |
| 2013 06 13 17 34 30 | 2468.214 |
| 2013 06 13 17 34 45 | 2468.213 |
| 2013 06 13 17 35 00 | 2468.212 |
| 2013 06 13 17 35 15 | 2468.212 |
| 2013 06 13 17 35 30 | 2468.212 |
| 2013 06 13 17 35 45 | 2468.21 |
| 2013 06 13 17 36 00 | 2468.209 |
| 2013 06 13 17 36 15 | 2468.208 |
| 2013 06 13 17 36 30 | 2468.208 |
| 2013 06 13 17 36 45 | 2468.209 |
| 2013 06 13 17 37 00 | 2468.208 |
| 2013 06 13 17 37 15 | 2468.207 |
| 2013 06 13 17 37 30 | 2468.207 |
| 2013 06 13 17 37 45 | 2468.206 |
| 2013 06 13 17 38 00 | 2468.206 |
| 2013 06 13 17 38 15 | 2468.206 |
| 2013 06 13 17 38 30 | 2468.205 |
| 2013 06 13 17 38 45 | 2468.204 |
| 2013 06 13 17 39 00 | 2468.203 |
| 2013 06 13 17 39 15 | 2468.204 |
| 2013 06 13 17 39 30 | 2468.204 |
| 2013 06 13 17 39 45 | 2468.203 |
| 2013 06 13 17 40 00 | 2468.2 |
| 2013 06 13 17 40 15 | 2468.199 |
| 2013 06 13 17 40 30 | 2468.198 |
| 2013 06 13 17 40 45 | 2468.198 |
| 2013 06 13 17 41 00 | 2468.196 |
| 2013 06 13 17 41 15 | 2468.195 |
| 2013 06 13 17 41 30 | 2468.195 |
| 2013 06 13 17 41 45 | 2468.194 |
| 2013 06 13 17 42 00 | 2468.194 |
| 2013 06 13 17 42 15 | 2468.193 |
| 2013 06 13 17 42 30 | 2468.192 |
| 2013 06 13 17 42 45 | 2468.191 |
| 2013 06 13 17 43 00 | 2468.192 |
| 2013 06 13 17 43 15 | 2468.191 |
| 2013 06 13 17 43 30 | 2468.191 |
| 2013 06 13 17 43 45 | 2468.19 |
| 2013 06 13 17 44 00 | 2468.191 |
| 2013 06 13 17 44 15 | 2468.191 |
| 2013 06 13 17 44 30 | 2468.191 |
| 2013 06 13 17 44 45 | 2468.189 |
| 2013 06 13 17 45 00 | 2468.189 |
| 2013 06 13 17 45 15 | 2468.19 |
| 2013 06 13 17 45 30 | 2468.189 |
| 2013 06 13 17 45 45 | 2468.188 |
| 2013 06 13 17 46 00 | 2468.187 |
| 2013 06 13 17 46 15 | 2468.186 |
| 2013 06 13 17 46 30 | 2468.186 |
| 2013 06 13 17 46 45 | 2468.186 |
| 2013 06 13 17 47 00 | 2468.185 |
| 2013 06 13 17 47 15 | 2468.184 |
| 2013 06 13 17 47 30 | 2468.183 |
| 2013 06 13 17 47 45 | 2468.181 |
| 2013 06 13 17 48 00 | 2468.181 |
| 2013 06 13 17 48 15 | 2468.182 |
| 2013 06 13 17 48 30 | 2468.181 |
| 2013 06 13 17 48 45 | 2468.18 |
| 2013 06 13 17 49 00 | 2468.18 |
| 2013 06 13 17 49 15 | 2468.18 |
| 2013 06 13 17 49 30 | 2468.18 |
| 2013 06 13 17 49 45 | 2468.179 |
| 2013 06 13 17 50 00 | 2468.178 |
| 2013 06 13 17 50 15 | 2468.177 |
| 2013 06 13 17 50 30 | 2468.177 |
| 2013 06 13 17 50 45 | 2468.177 |
| 2013 06 13 17 51 00 | 2468.176 |
| 2013 06 13 17 51 15 | 2468.176 |
| 2013 06 13 17 51 30 | 2468.176 |
| 2013 06 13 17 51 45 | 2468.175 |
| 2013 06 13 17 52 00 | 2468.173 |
| 2013 06 13 17 52 15 | 2468.172 |
| 2013 06 13 17 52 30 | 2468.171 |
| 2013 06 13 17 52 45 | 2468.17 |
| 2013 06 13 17 53 00 | 2468.17 |
| 2013 06 13 17 53 15 | 2468.17 |
| 2013 06 13 17 53 30 | 2468.17 |
| 2013 06 13 17 53 45 | 2468.17 |
| 2013 06 13 17 54 00 | 2468.17 |
| 2013 06 13 17 54 15 | 2468.171 |
| 2013 06 13 17 54 30 | 2468.172 |
| 2013 06 13 17 54 45 | 2468.171 |
| 2013 06 13 17 55 00 | 2468.171 |
| 2013 06 13 17 55 15 | 2468.171 |
| 2013 06 13 17 55 30 | 2468.17 |
| 2013 06 13 17 55 45 | 2468.17 |
| 2013 06 13 17 56 00 | 2468.169 |
| 2013 06 13 17 56 15 | 2468.166 |
| 2013 06 13 17 56 30 | 2468.164 |
| 2013 06 13 17 56 45 | 2468.163 |
| 2013 06 13 17 57 00 | 2468.161 |
| 2013 06 13 17 57 15 | 2468.16 |
| 2013 06 13 17 57 30 | 2468.16 |
| 2013 06 13 17 57 45 | 2468.159 |
| 2013 06 13 17 58 00 | 2468.159 |
| 2013 06 13 17 58 15 | 2468.158 |
| 2013 06 13 17 58 30 | 2468.157 |
| 2013 06 13 17 58 45 | 2468.157 |
| 2013 06 13 17 59 00 | 2468.156 |
| 2013 06 13 17 59 15 | 2468.155 |
| 2013 06 13 17 59 30 | 2468.156 |
| 2013 06 13 17 59 45 | 2468.156 |
| 2013 06 13 18 00 15 | 2468.155 |
| 2013 06 13 18 00 30 | 2468.155 |
| 2013 06 13 18 00 45 | 2468.154 |
| 2013 06 13 18 01 00 | 2468.154 |
| 2013 06 13 18 01 15 | 2468.152 |
| 2013 06 13 18 01 30 | 2468.152 |
| 2013 06 13 18 01 45 | 2468.152 |
| 2013 06 13 18 02 00 | 2468.151 |
| 2013 06 13 18 02 15 | 2468.151 |
| 2013 06 13 18 02 30 | 2468.15 |
| 2013 06 13 18 02 45 | 2468.149 |
| 2013 06 13 18 03 00 | 2468.149 |
| 2013 06 13 18 03 15 | 2468.149 |
| 2013 06 13 18 03 30 | 2468.148 |
| 2013 06 13 18 03 45 | 2468.147 |
| 2013 06 13 18 04 00 | 2468.146 |
| 2013 06 13 18 04 15 | 2468.145 |
| 2013 06 13 18 04 30 | 2468.144 |
| 2013 06 13 18 04 45 | 2468.144 |
| 2013 06 13 18 05 00 | 2468.143 |
| 2013 06 13 18 05 15 | 2468.141 |
| 2013 06 13 18 05 30 | 2468.14 |
| 2013 06 13 18 05 45 | 2468.14 |
| 2013 06 13 18 06 00 | 2468.139 |
| 2013 06 13 18 06 15 | 2468.139 |
| 2013 06 13 18 06 30 | 2468.138 |
| 2013 06 13 18 06 45 | 2468.136 |
| 2013 06 13 18 07 00 | 2468.135 |
| 2013 06 13 18 07 15 | 2468.135 |
| 2013 06 13 18 07 30 | 2468.135 |
| 2013 06 13 18 07 45 | 2468.134 |
| 2013 06 13 18 08 00 | 2468.134 |
| 2013 06 13 18 08 15 | 2468.134 |
| 2013 06 13 18 08 30 | 2468.134 |
| 2013 06 13 18 08 45 | 2468.133 |
| 2013 06 13 18 09 00 | 2468.132 |
| 2013 06 13 18 09 15 | 2468.131 |
| 2013 06 13 18 09 30 | 2468.131 |
| 2013 06 13 18 09 45 | 2468.13 |
| 2013 06 13 18 10 00 | 2468.13 |
| 2013 06 13 18 10 15 | 2468.129 |
| 2013 06 13 18 10 30 | 2468.129 |
| 2013 06 13 18 10 45 | 2468.129 |
| 2013 06 13 18 11 00 | 2468.128 |
| 2013 06 13 18 11 15 | 2468.128 |
| 2013 06 13 18 11 30 | 2468.128 |
| 2013 06 13 18 11 45 | 2468.127 |
| 2013 06 13 18 12 00 | 2468.126 |
| 2013 06 13 18 12 15 | 2468.125 |
| 2013 06 13 18 12 30 | 2468.124 |
| 2013 06 13 18 12 45 | 2468.124 |
| 2013 06 13 18 13 00 | 2468.122 |
| 2013 06 13 18 13 15 | 2468.121 |
| 2013 06 13 18 13 30 | 2468.119 |
| 2013 06 13 18 13 45 | 2468.119 |
| 2013 06 13 18 14 00 | 2468.118 |
| 2013 06 13 18 14 15 | 2468.117 |
| 2013 06 13 18 14 30 | 2468.117 |
| 2013 06 13 18 14 45 | 2468.117 |
| 2013 06 13 18 15 00 | 2468.116 |
| 2013 06 13 18 15 15 | 2468.116 |
| 2013 06 13 18 15 30 | 2468.115 |
| 2013 06 13 18 15 45 | 2468.113 |
| 2013 06 13 18 16 00 | 2468.111 |
| 2013 06 13 18 16 15 | 2468.11 |
| 2013 06 13 18 16 30 | 2468.109 |
| 2013 06 13 18 16 45 | 2468.109 |
| 2013 06 13 18 17 00 | 2468.109 |
| 2013 06 13 18 17 15 | 2468.108 |
| 2013 06 13 18 17 30 | 2468.108 |
| 2013 06 13 18 17 45 | 2468.108 |
| 2013 06 13 18 18 00 | 2468.107 |
| 2013 06 13 18 18 15 | 2468.106 |
| 2013 06 13 18 18 30 | 2468.106 |
| 2013 06 13 18 18 45 | 2468.105 |
| 2013 06 13 18 19 00 | 2468.105 |
| 2013 06 13 18 19 15 | 2468.105 |
| 2013 06 13 18 19 30 | 2468.106 |
| 2013 06 13 18 19 45 | 2468.106 |
| 2013 06 13 18 20 00 | 2468.106 |
| 2013 06 13 18 20 15 | 2468.105 |
| 2013 06 13 18 20 30 | 2468.104 |
| 2013 06 13 18 20 45 | 2468.102 |
| 2013 06 13 18 21 00 | 2468.101 |
| 2013 06 13 18 21 15 | 2468.099 |
| 2013 06 13 18 21 30 | 2468.098 |
| 2013 06 13 18 21 45 | 2468.095 |
| 2013 06 13 18 22 00 | 2468.094 |
| 2013 06 13 18 22 15 | 2468.093 |
| 2013 06 13 18 22 30 | 2468.092 |
| 2013 06 13 18 22 45 | 2468.092 |
| 2013 06 13 18 23 00 | 2468.091 |
| 2013 06 13 18 23 15 | 2468.092 |
| 2013 06 13 18 23 30 | 2468.091 |
| 2013 06 13 18 23 45 | 2468.091 |
| 2013 06 13 18 24 00 | 2468.09 |
| 2013 06 13 18 24 15 | 2468.09 |
| 2013 06 13 18 24 30 | 2468.09 |
| 2013 06 13 18 24 45 | 2468.09 |
| 2013 06 13 18 25 00 | 2468.089 |
| 2013 06 13 18 25 15 | 2468.089 |
| 2013 06 13 18 25 30 | 2468.089 |
| 2013 06 13 18 25 45 | 2468.088 |
| 2013 06 13 18 26 00 | 2468.086 |
| 2013 06 13 18 26 15 | 2468.086 |
| 2013 06 13 18 26 30 | 2468.085 |
| 2013 06 13 18 26 45 | 2468.085 |
| 2013 06 13 18 27 00 | 2468.085 |
| 2013 06 13 18 27 15 | 2468.084 |
| 2013 06 13 18 27 30 | 2468.083 |
| 2013 06 13 18 27 45 | 2468.083 |
| 2013 06 13 18 28 00 | 2468.082 |
| 2013 06 13 18 28 15 | 2468.081 |
| 2013 06 13 18 28 30 | 2468.08 |
| 2013 06 13 18 28 45 | 2468.08 |
| 2013 06 13 18 29 00 | 2468.079 |
| 2013 06 13 18 29 15 | 2468.079 |
| 2013 06 13 18 29 30 | 2468.078 |
| 2013 06 13 18 29 45 | 2468.077 |
| 2013 06 13 18 30 00 | 2468.076 |
| 2013 06 13 18 30 15 | 2468.075 |
| 2013 06 13 18 30 30 | 2468.074 |
| 2013 06 13 18 30 45 | 2468.073 |
| 2013 06 13 18 31 00 | 2468.073 |
| 2013 06 13 18 31 15 | 2468.072 |
| 2013 06 13 18 31 30 | 2468.071 |
| 2013 06 13 18 31 45 | 2468.07 |
| 2013 06 13 18 32 00 | 2468.069 |
| 2013 06 13 18 32 15 | 2468.068 |
| 2013 06 13 18 32 30 | 2468.068 |
| 2013 06 13 18 32 45 | 2468.067 |
| 2013 06 13 18 33 00 | 2468.066 |
| 2013 06 13 18 33 15 | 2468.065 |
| 2013 06 13 18 33 30 | 2468.064 |
| 2013 06 13 18 33 45 | 2468.063 |
| 2013 06 13 18 34 00 | 2468.062 |
| 2013 06 13 18 34 15 | 2468.061 |
| 2013 06 13 18 34 30 | 2468.061 |
| 2013 06 13 18 34 45 | 2468.06 |
| 2013 06 13 18 35 00 | 2468.059 |
| 2013 06 13 18 35 15 | 2468.059 |
| 2013 06 13 18 35 30 | 2468.058 |
| 2013 06 13 18 35 45 | 2468.057 |
| 2013 06 13 18 36 00 | 2468.056 |
| 2013 06 13 18 36 15 | 2468.056 |
| 2013 06 13 18 36 30 | 2468.055 |
| 2013 06 13 18 36 45 | 2468.055 |
| 2013 06 13 18 37 00 | 2468.055 |
| 2013 06 13 18 37 15 | 2468.054 |
| 2013 06 13 18 37 30 | 2468.053 |
| 2013 06 13 18 37 45 | 2468.052 |
| 2013 06 13 18 38 00 | 2468.052 |
| 2013 06 13 18 38 15 | 2468.052 |
| 2013 06 13 18 38 30 | 2468.051 |
| 2013 06 13 18 38 45 | 2468.05 |
| 2013 06 13 18 39 00 | 2468.05 |
| 2013 06 13 18 39 15 | 2468.049 |
| 2013 06 13 18 39 30 | 2468.049 |
| 2013 06 13 18 39 45 | 2468.049 |
| 2013 06 13 18 40 00 | 2468.048 |
| 2013 06 13 18 40 15 | 2468.046 |
| 2013 06 13 18 40 30 | 2468.046 |
| 2013 06 13 18 40 45 | 2468.045 |
| 2013 06 13 18 41 00 | 2468.044 |
| 2013 06 13 18 41 15 | 2468.044 |
| 2013 06 13 18 41 30 | 2468.043 |
| 2013 06 13 18 41 45 | 2468.042 |
| 2013 06 13 18 42 00 | 2468.042 |
| 2013 06 13 18 42 15 | 2468.041 |
| 2013 06 13 18 42 30 | 2468.041 |
| 2013 06 13 18 42 45 | 2468.04 |
| 2013 06 13 18 43 00 | 2468.04 |
| 2013 06 13 18 43 15 | 2468.039 |
| 2013 06 13 18 43 30 | 2468.038 |
| 2013 06 13 18 43 45 | 2468.037 |
| 2013 06 13 18 44 00 | 2468.037 |
| 2013 06 13 18 44 15 | 2468.036 |
| 2013 06 13 18 44 30 | 2468.035 |
| 2013 06 13 18 44 45 | 2468.033 |
| 2013 06 13 18 45 00 | 2468.033 |
| 2013 06 13 18 45 15 | 2468.032 |
| 2013 06 13 18 45 30 | 2468.031 |
| 2013 06 13 18 45 45 | 2468.03 |
| 2013 06 13 18 46 00 | 2468.029 |
| 2013 06 13 18 46 15 | 2468.029 |
| 2013 06 13 18 46 30 | 2468.027 |
| 2013 06 13 18 46 45 | 2468.026 |
| 2013 06 13 18 47 00 | 2468.026 |
| 2013 06 13 18 47 15 | 2468.026 |
| 2013 06 13 18 47 30 | 2468.025 |
| 2013 06 13 18 47 45 | 2468.025 |
| 2013 06 13 18 48 00 | 2468.024 |
| 2013 06 13 18 48 15 | 2468.023 |
| 2013 06 13 18 48 30 | 2468.024 |
| 2013 06 13 18 48 45 | 2468.023 |
| 2013 06 13 18 49 00 | 2468.023 |
| 2013 06 13 18 49 15 | 2468.022 |
| 2013 06 13 18 49 30 | 2468.021 |
| 2013 06 13 18 49 45 | 2468.021 |
| 2013 06 13 18 50 00 | 2468.02 |
| 2013 06 13 18 50 15 | 2468.019 |
| 2013 06 13 18 50 30 | 2468.018 |
| 2013 06 13 18 50 45 | 2468.017 |
| 2013 06 13 18 51 00 | 2468.017 |
| 2013 06 13 18 51 15 | 2468.016 |
| 2013 06 13 18 51 30 | 2468.015 |
| 2013 06 13 18 51 45 | 2468.014 |
| 2013 06 13 18 52 00 | 2468.014 |
| 2013 06 13 18 52 15 | 2468.014 |
| 2013 06 13 18 52 30 | 2468.014 |
| 2013 06 13 18 52 45 | 2468.013 |
| 2013 06 13 18 53 00 | 2468.013 |
| 2013 06 13 18 53 15 | 2468.013 |
| 2013 06 13 18 53 30 | 2468.012 |
| 2013 06 13 18 53 45 | 2468.011 |
| 2013 06 13 18 54 00 | 2468.01 |
| 2013 06 13 18 54 15 | 2468.01 |
| 2013 06 13 18 54 30 | 2468.009 |
| 2013 06 13 18 54 45 | 2468.008 |
| 2013 06 13 18 55 00 | 2468.008 |
| 2013 06 13 18 55 15 | 2468.007 |
| 2013 06 13 18 55 30 | 2468.007 |
| 2013 06 13 18 55 45 | 2468.006 |
| 2013 06 13 18 56 00 | 2468.005 |
| 2013 06 13 18 56 15 | 2468.004 |
| 2013 06 13 18 56 30 | 2468.003 |
| 2013 06 13 18 56 45 | 2468.003 |
| 2013 06 13 18 57 00 | 2468.003 |
| 2013 06 13 18 57 15 | 2468.002 |
| 2013 06 13 18 57 30 | 2468.001 |
| 2013 06 13 18 57 45 | 2468.001 |
| 2013 06 13 18 58 00 | 2468 |
| 2013 06 13 18 58 15 | 2467.999 |
| 2013 06 13 18 58 30 | 2467.999 |
| 2013 06 13 18 58 45 | 2467.999 |
| 2013 06 13 18 59 00 | 2467.998 |
| 2013 06 13 18 59 15 | 2467.997 |
| 2013 06 13 18 59 30 | 2467.996 |
| 2013 06 13 18 59 45 | 2467.996 |
| 2013 06 13 19 00 15 | 2467.995 |
| 2013 06 13 19 00 30 | 2467.994 |
| 2013 06 13 19 00 45 | 2467.993 |
| 2013 06 13 19 01 00 | 2467.993 |
| 2013 06 13 19 01 15 | 2467.993 |
| 2013 06 13 19 01 30 | 2467.992 |
| 2013 06 13 19 01 45 | 2467.992 |
| 2013 06 13 19 02 00 | 2467.992 |
| 2013 06 13 19 02 15 | 2467.991 |
| 2013 06 13 19 02 30 | 2467.99 |
| 2013 06 13 19 02 45 | 2467.989 |
| 2013 06 13 19 03 00 | 2467.989 |
| 2013 06 13 19 03 15 | 2467.989 |
| 2013 06 13 19 03 30 | 2467.99 |
| 2013 06 13 19 03 45 | 2467.99 |
| 2013 06 13 19 04 00 | 2467.99 |
| 2013 06 13 19 04 15 | 2467.989 |
| 2013 06 13 19 04 30 | 2467.989 |
| 2013 06 13 19 04 45 | 2467.989 |
| 2013 06 13 19 05 00 | 2467.988 |
| 2013 06 13 19 05 15 | 2467.988 |
| 2013 06 13 19 05 30 | 2467.987 |
| 2013 06 13 19 05 45 | 2467.987 |
| 2013 06 13 19 06 00 | 2467.986 |
| 2013 06 13 19 06 15 | 2467.986 |
| 2013 06 13 19 06 30 | 2467.984 |
| 2013 06 13 19 06 45 | 2467.984 |
| 2013 06 13 19 07 00 | 2467.983 |
| 2013 06 13 19 07 15 | 2467.983 |
| 2013 06 13 19 07 30 | 2467.982 |
| 2013 06 13 19 07 45 | 2467.982 |
| 2013 06 13 19 08 00 | 2467.981 |
| 2013 06 13 19 08 15 | 2467.981 |
| 2013 06 13 19 08 30 | 2467.981 |
| 2013 06 13 19 08 45 | 2467.98 |
| 2013 06 13 19 09 00 | 2467.979 |
| 2013 06 13 19 09 15 | 2467.979 |
| 2013 06 13 19 09 30 | 2467.979 |
| 2013 06 13 19 09 45 | 2467.978 |
| 2013 06 13 19 10 00 | 2467.977 |
| 2013 06 13 19 10 15 | 2467.977 |
| 2013 06 13 19 10 30 | 2467.976 |
| 2013 06 13 19 10 45 | 2467.976 |
| 2013 06 13 19 11 00 | 2467.975 |
| 2013 06 13 19 11 15 | 2467.975 |
| 2013 06 13 19 11 30 | 2467.975 |
| 2013 06 13 19 11 45 | 2467.974 |
| 2013 06 13 19 12 00 | 2467.973 |
| 2013 06 13 19 12 15 | 2467.972 |
| 2013 06 13 19 12 30 | 2467.972 |
| 2013 06 13 19 12 45 | 2467.971 |
| 2013 06 13 19 13 00 | 2467.97 |
| 2013 06 13 19 13 15 | 2467.969 |
| 2013 06 13 19 13 30 | 2467.968 |
| 2013 06 13 19 13 45 | 2467.968 |
| 2013 06 13 19 14 00 | 2467.968 |
| 2013 06 13 19 14 15 | 2467.967 |
| 2013 06 13 19 14 30 | 2467.966 |
| 2013 06 13 19 14 45 | 2467.965 |
| 2013 06 13 19 15 00 | 2467.964 |
| 2013 06 13 19 15 15 | 2467.964 |
| 2013 06 13 19 15 30 | 2467.963 |
| 2013 06 13 19 15 45 | 2467.963 |
| 2013 06 13 19 16 00 | 2467.963 |
| 2013 06 13 19 16 15 | 2467.962 |
| 2013 06 13 19 16 30 | 2467.962 |
| 2013 06 13 19 16 45 | 2467.961 |
| 2013 06 13 19 17 00 | 2467.961 |
| 2013 06 13 19 17 15 | 2467.961 |
| 2013 06 13 19 17 30 | 2467.96 |
| 2013 06 13 19 17 45 | 2467.96 |
| 2013 06 13 19 18 00 | 2467.959 |
| 2013 06 13 19 18 15 | 2467.959 |
| 2013 06 13 19 18 30 | 2467.959 |
| 2013 06 13 19 18 45 | 2467.958 |
| 2013 06 13 19 19 00 | 2467.957 |
| 2013 06 13 19 19 15 | 2467.956 |
| 2013 06 13 19 19 30 | 2467.956 |
| 2013 06 13 19 19 45 | 2467.955 |
| 2013 06 13 19 20 00 | 2467.954 |
| 2013 06 13 19 20 15 | 2467.954 |
| 2013 06 13 19 20 30 | 2467.953 |
| 2013 06 13 19 20 45 | 2467.952 |
| 2013 06 13 19 21 00 | 2467.951 |
| 2013 06 13 19 21 15 | 2467.951 |
| 2013 06 13 19 21 30 | 2467.951 |
| 2013 06 13 19 21 45 | 2467.95 |
| 2013 06 13 19 22 00 | 2467.95 |
| 2013 06 13 19 22 15 | 2467.95 |
| 2013 06 13 19 22 30 | 2467.95 |
| 2013 06 13 19 22 45 | 2467.949 |
| 2013 06 13 19 23 00 | 2467.948 |
| 2013 06 13 19 23 15 | 2467.948 |
| 2013 06 13 19 23 30 | 2467.948 |
| 2013 06 13 19 23 45 | 2467.947 |
| 2013 06 13 19 24 00 | 2467.947 |
| 2013 06 13 19 24 15 | 2467.946 |
| 2013 06 13 19 24 30 | 2467.946 |
| 2013 06 13 19 24 45 | 2467.946 |
| 2013 06 13 19 25 00 | 2467.945 |
| 2013 06 13 19 25 15 | 2467.944 |
| 2013 06 13 19 25 30 | 2467.944 |
| 2013 06 13 19 25 45 | 2467.943 |
| 2013 06 13 19 26 00 | 2467.942 |
| 2013 06 13 19 26 15 | 2467.94 |
| 2013 06 13 19 26 30 | 2467.939 |
| 2013 06 13 19 26 45 | 2467.939 |
| 2013 06 13 19 27 00 | 2467.939 |
| 2013 06 13 19 27 15 | 2467.939 |
| 2013 06 13 19 27 30 | 2467.939 |
| 2013 06 13 19 27 45 | 2467.939 |
| 2013 06 13 19 28 00 | 2467.939 |
| 2013 06 13 19 28 15 | 2467.939 |
| 2013 06 13 19 28 30 | 2467.94 |
| 2013 06 13 19 28 45 | 2467.94 |
| 2013 06 13 19 29 00 | 2467.94 |
| 2013 06 13 19 29 15 | 2467.94 |
| 2013 06 13 19 29 30 | 2467.939 |
| 2013 06 13 19 29 45 | 2467.939 |
| 2013 06 13 19 30 00 | 2467.938 |
| 2013 06 13 19 30 15 | 2467.938 |
| 2013 06 13 19 30 30 | 2467.937 |
| 2013 06 13 19 30 45 | 2467.936 |
| 2013 06 13 19 31 00 | 2467.936 |
| 2013 06 13 19 31 15 | 2467.935 |
| 2013 06 13 19 31 30 | 2467.935 |
| 2013 06 13 19 31 45 | 2467.934 |
| 2013 06 13 19 32 00 | 2467.933 |
| 2013 06 13 19 32 15 | 2467.933 |
| 2013 06 13 19 32 30 | 2467.933 |
| 2013 06 13 19 32 45 | 2467.932 |
| 2013 06 13 19 33 00 | 2467.931 |
| 2013 06 13 19 33 15 | 2467.931 |
| 2013 06 13 19 33 30 | 2467.93 |
| 2013 06 13 19 33 45 | 2467.93 |
| 2013 06 13 19 34 00 | 2467.93 |
| 2013 06 13 19 34 15 | 2467.929 |
| 2013 06 13 19 34 30 | 2467.928 |
| 2013 06 13 19 34 45 | 2467.928 |
| 2013 06 13 19 35 00 | 2467.928 |
| 2013 06 13 19 35 15 | 2467.928 |
| 2013 06 13 19 35 30 | 2467.928 |
| 2013 06 13 19 35 45 | 2467.928 |
| 2013 06 13 19 36 00 | 2467.927 |
| 2013 06 13 19 36 15 | 2467.927 |
| 2013 06 13 19 36 30 | 2467.928 |
| 2013 06 13 19 36 45 | 2467.927 |
| 2013 06 13 19 37 00 | 2467.927 |
| 2013 06 13 19 37 15 | 2467.926 |
| 2013 06 13 19 37 30 | 2467.926 |
| 2013 06 13 19 37 45 | 2467.925 |
| 2013 06 13 19 38 00 | 2467.924 |
| 2013 06 13 19 38 15 | 2467.923 |
| 2013 06 13 19 38 30 | 2467.923 |
| 2013 06 13 19 38 45 | 2467.922 |
| 2013 06 13 19 39 00 | 2467.922 |
| 2013 06 13 19 39 15 | 2467.921 |
| 2013 06 13 19 39 30 | 2467.92 |
| 2013 06 13 19 39 45 | 2467.919 |
| 2013 06 13 19 40 00 | 2467.919 |
| 2013 06 13 19 40 15 | 2467.919 |
| 2013 06 13 19 40 30 | 2467.919 |
| 2013 06 13 19 40 45 | 2467.918 |
| 2013 06 13 19 41 00 | 2467.917 |
| 2013 06 13 19 41 15 | 2467.916 |
| 2013 06 13 19 41 30 | 2467.915 |
| 2013 06 13 19 41 45 | 2467.914 |
| 2013 06 13 19 42 00 | 2467.914 |
| 2013 06 13 19 42 15 | 2467.913 |
| 2013 06 13 19 42 30 | 2467.913 |
| 2013 06 13 19 42 45 | 2467.912 |
| 2013 06 13 19 43 00 | 2467.912 |
| 2013 06 13 19 43 15 | 2467.911 |
| 2013 06 13 19 43 30 | 2467.91 |
| 2013 06 13 19 43 45 | 2467.91 |
| 2013 06 13 19 44 00 | 2467.91 |
| 2013 06 13 19 44 15 | 2467.91 |
| 2013 06 13 19 44 30 | 2467.909 |
| 2013 06 13 19 44 45 | 2467.909 |
| 2013 06 13 19 45 00 | 2467.908 |
| 2013 06 13 19 45 15 | 2467.907 |
| 2013 06 13 19 45 30 | 2467.907 |
| 2013 06 13 19 45 45 | 2467.906 |
| 2013 06 13 19 46 00 | 2467.905 |
| 2013 06 13 19 46 15 | 2467.905 |
| 2013 06 13 19 46 30 | 2467.905 |
| 2013 06 13 19 46 45 | 2467.904 |
| 2013 06 13 19 47 00 | 2467.903 |
| 2013 06 13 19 47 15 | 2467.902 |
| 2013 06 13 19 47 30 | 2467.902 |
| 2013 06 13 19 47 45 | 2467.902 |
| 2013 06 13 19 48 00 | 2467.901 |
| 2013 06 13 19 48 15 | 2467.901 |
| 2013 06 13 19 48 30 | 2467.9 |
| 2013 06 13 19 48 45 | 2467.901 |
| 2013 06 13 19 49 00 | 2467.9 |
| 2013 06 13 19 49 15 | 2467.901 |
| 2013 06 13 19 49 30 | 2467.901 |
| 2013 06 13 19 49 45 | 2467.901 |
| 2013 06 13 19 50 00 | 2467.902 |
| 2013 06 13 19 50 15 | 2467.902 |
| 2013 06 13 19 50 30 | 2467.903 |
| 2013 06 13 19 50 45 | 2467.904 |
| 2013 06 13 19 51 00 | 2467.904 |
| 2013 06 13 19 51 15 | 2467.905 |
| 2013 06 13 19 51 30 | 2467.905 |
| 2013 06 13 19 51 45 | 2467.905 |
| 2013 06 13 19 52 00 | 2467.905 |
| 2013 06 13 19 52 15 | 2467.904 |
| 2013 06 13 19 52 30 | 2467.903 |
| 2013 06 13 19 52 45 | 2467.903 |
| 2013 06 13 19 53 00 | 2467.903 |
| 2013 06 13 19 53 15 | 2467.902 |
| 2013 06 13 19 53 30 | 2467.9 |
| 2013 06 13 19 53 45 | 2467.899 |
| 2013 06 13 19 54 00 | 2467.899 |
| 2013 06 13 19 54 15 | 2467.899 |
| 2013 06 13 19 54 30 | 2467.898 |
| 2013 06 13 19 54 45 | 2467.897 |
| 2013 06 13 19 55 00 | 2467.896 |
| 2013 06 13 19 55 15 | 2467.896 |
| 2013 06 13 19 55 30 | 2467.895 |
| 2013 06 13 19 55 45 | 2467.895 |
| 2013 06 13 19 56 00 | 2467.894 |
| 2013 06 13 19 56 15 | 2467.894 |
| 2013 06 13 19 56 30 | 2467.893 |
| 2013 06 13 19 56 45 | 2467.892 |
| 2013 06 13 19 57 00 | 2467.891 |
| 2013 06 13 19 57 15 | 2467.891 |
| 2013 06 13 19 57 30 | 2467.891 |
| 2013 06 13 19 57 45 | 2467.89 |
| 2013 06 13 19 58 00 | 2467.89 |
| 2013 06 13 19 58 15 | 2467.889 |
| 2013 06 13 19 58 30 | 2467.889 |
| 2013 06 13 19 58 45 | 2467.889 |
| 2013 06 13 19 59 00 | 2467.888 |
| 2013 06 13 19 59 15 | 2467.888 |
| 2013 06 13 19 59 30 | 2467.887 |
| 2013 06 13 19 59 45 | 2467.887 |
| 2013 06 13 20 00 15 | 2467.885 |
| 2013 06 13 20 00 30 | 2467.885 |
| 2013 06 13 20 00 45 | 2467.885 |
| 2013 06 13 20 01 00 | 2467.885 |
| 2013 06 13 20 01 15 | 2467.884 |
| 2013 06 13 20 01 30 | 2467.882 |
| 2013 06 13 20 01 45 | 2467.882 |
| 2013 06 13 20 02 00 | 2467.882 |
| 2013 06 13 20 02 15 | 2467.882 |
| 2013 06 13 20 02 30 | 2467.882 |
| 2013 06 13 20 02 45 | 2467.881 |
| 2013 06 13 20 03 00 | 2467.88 |
| 2013 06 13 20 03 15 | 2467.88 |
| 2013 06 13 20 03 30 | 2467.88 |
| 2013 06 13 20 03 45 | 2467.879 |
| 2013 06 13 20 04 00 | 2467.879 |
| 2013 06 13 20 04 15 | 2467.879 |
| 2013 06 13 20 04 30 | 2467.879 |
| 2013 06 13 20 04 45 | 2467.878 |
| 2013 06 13 20 05 00 | 2467.877 |
| 2013 06 13 20 05 15 | 2467.877 |
| 2013 06 13 20 05 30 | 2467.877 |
| 2013 06 13 20 05 45 | 2467.877 |
| 2013 06 13 20 06 00 | 2467.877 |
| 2013 06 13 20 06 15 | 2467.876 |
| 2013 06 13 20 06 30 | 2467.876 |
| 2013 06 13 20 06 45 | 2467.875 |
| 2013 06 13 20 07 00 | 2467.874 |
| 2013 06 13 20 07 15 | 2467.874 |
| 2013 06 13 20 07 30 | 2467.874 |
| 2013 06 13 20 07 45 | 2467.875 |
| 2013 06 13 20 08 00 | 2467.875 |
| 2013 06 13 20 08 15 | 2467.876 |
| 2013 06 13 20 08 30 | 2467.876 |
| 2013 06 13 20 08 45 | 2467.876 |
| 2013 06 13 20 09 00 | 2467.876 |
| 2013 06 13 20 09 15 | 2467.875 |
| 2013 06 13 20 09 30 | 2467.875 |
| 2013 06 13 20 09 45 | 2467.874 |
| 2013 06 13 20 10 00 | 2467.874 |
| 2013 06 13 20 10 15 | 2467.874 |
| 2013 06 13 20 10 30 | 2467.874 |
| 2013 06 13 20 10 45 | 2467.874 |
| 2013 06 13 20 11 00 | 2467.874 |
| 2013 06 13 20 11 15 | 2467.874 |
| 2013 06 13 20 11 30 | 2467.875 |
| 2013 06 13 20 11 45 | 2467.875 |
| 2013 06 13 20 12 00 | 2467.875 |
| 2013 06 13 20 12 15 | 2467.876 |
| 2013 06 13 20 12 30 | 2467.876 |
| 2013 06 13 20 12 45 | 2467.877 |
| 2013 06 13 20 13 00 | 2467.878 |
| 2013 06 13 20 13 15 | 2467.878 |
| 2013 06 13 20 13 30 | 2467.879 |
| 2013 06 13 20 13 45 | 2467.88 |
| 2013 06 13 20 14 00 | 2467.88 |
| 2013 06 13 20 14 15 | 2467.88 |
| 2013 06 13 20 14 30 | 2467.881 |
| 2013 06 13 20 14 45 | 2467.881 |
| 2013 06 13 20 15 00 | 2467.881 |
| 2013 06 13 20 15 15 | 2467.88 |
| 2013 06 13 20 15 30 | 2467.879 |
| 2013 06 13 20 15 45 | 2467.878 |
| 2013 06 13 20 16 00 | 2467.876 |
| 2013 06 13 20 16 15 | 2467.874 |
| 2013 06 13 20 16 30 | 2467.872 |
| 2013 06 13 20 16 45 | 2467.87 |
| 2013 06 13 20 17 00 | 2467.869 |
| 2013 06 13 20 17 15 | 2467.867 |
| 2013 06 13 20 17 30 | 2467.865 |
| 2013 06 13 20 17 45 | 2467.863 |
| 2013 06 13 20 18 00 | 2467.862 |
| 2013 06 13 20 18 15 | 2467.86 |
| 2013 06 13 20 18 30 | 2467.858 |
| 2013 06 13 20 18 45 | 2467.856 |
| 2013 06 13 20 19 00 | 2467.854 |
| 2013 06 13 20 19 15 | 2467.852 |
| 2013 06 13 20 19 30 | 2467.851 |
| 2013 06 13 20 19 45 | 2467.848 |
| 2013 06 13 20 20 00 | 2467.846 |
| 2013 06 13 20 20 15 | 2467.844 |
| 2013 06 13 20 20 30 | 2467.842 |
| 2013 06 13 20 20 45 | 2467.84 |
| 2013 06 13 20 21 00 | 2467.838 |
| 2013 06 13 20 21 15 | 2467.835 |
| 2013 06 13 20 21 30 | 2467.833 |
| 2013 06 13 20 21 45 | 2467.832 |
| 2013 06 13 20 22 00 | 2467.83 |
| 2013 06 13 20 22 15 | 2467.83 |
| 2013 06 13 20 22 30 | 2467.83 |
| 2013 06 13 20 22 45 | 2467.831 |
| 2013 06 13 20 23 00 | 2467.834 |
| 2013 06 13 20 23 15 | 2467.835 |
| 2013 06 13 20 23 30 | 2467.838 |
| 2013 06 13 20 23 45 | 2467.84 |
| 2013 06 13 20 24 00 | 2467.841 |
| 2013 06 13 20 24 15 | 2467.842 |
| 2013 06 13 20 24 30 | 2467.841 |
| 2013 06 13 20 24 45 | 2467.841 |
| 2013 06 13 20 25 00 | 2467.841 |
| 2013 06 13 20 25 15 | 2467.841 |
| 2013 06 13 20 25 30 | 2467.841 |
| 2013 06 13 20 25 45 | 2467.841 |
| 2013 06 13 20 26 00 | 2467.842 |
| 2013 06 13 20 26 15 | 2467.841 |
| 2013 06 13 20 26 30 | 2467.84 |
| 2013 06 13 20 26 45 | 2467.839 |
| 2013 06 13 20 27 00 | 2467.84 |
| 2013 06 13 20 27 15 | 2467.843 |
| 2013 06 13 20 27 30 | 2467.846 |
| 2013 06 13 20 27 45 | 2467.849 |
| 2013 06 13 20 28 00 | 2467.852 |
| 2013 06 13 20 28 15 | 2467.854 |
| 2013 06 13 20 28 30 | 2467.854 |
| 2013 06 13 20 28 45 | 2467.855 |
| 2013 06 13 20 29 00 | 2467.857 |
| 2013 06 13 20 29 15 | 2467.859 |
| 2013 06 13 20 29 30 | 2467.862 |
| 2013 06 13 20 29 45 | 2467.863 |
| 2013 06 13 20 30 00 | 2467.865 |
| 2013 06 13 20 30 15 | 2467.867 |
| 2013 06 13 20 30 30 | 2467.869 |
| 2013 06 13 20 30 45 | 2467.872 |
| 2013 06 13 20 31 00 | 2467.874 |
| 2013 06 13 20 31 15 | 2467.873 |
| 2013 06 13 20 31 30 | 2467.872 |
| 2013 06 13 20 31 45 | 2467.87 |
| 2013 06 13 20 32 00 | 2467.869 |
| 2013 06 13 20 32 15 | 2467.868 |
| 2013 06 13 20 32 30 | 2467.868 |
| 2013 06 13 20 32 45 | 2467.867 |
| 2013 06 13 20 33 00 | 2467.866 |
| 2013 06 13 20 33 15 | 2467.865 |
| 2013 06 13 20 33 30 | 2467.865 |
| 2013 06 13 20 33 45 | 2467.865 |
| 2013 06 13 20 34 00 | 2467.865 |
| 2013 06 13 20 34 15 | 2467.863 |
| 2013 06 13 20 34 30 | 2467.863 |
| 2013 06 13 20 34 45 | 2467.863 |
| 2013 06 13 20 35 00 | 2467.864 |
| 2013 06 13 20 35 15 | 2467.865 |
| 2013 06 13 20 35 30 | 2467.867 |
| 2013 06 13 20 35 45 | 2467.868 |
| 2013 06 13 20 36 00 | 2467.869 |
| 2013 06 13 20 36 15 | 2467.87 |
| 2013 06 13 20 36 30 | 2467.871 |
| 2013 06 13 20 36 45 | 2467.871 |
| 2013 06 13 20 37 00 | 2467.871 |
| 2013 06 13 20 37 15 | 2467.871 |
| 2013 06 13 20 37 30 | 2467.871 |
| 2013 06 13 20 37 45 | 2467.872 |
| 2013 06 13 20 38 00 | 2467.871 |
| 2013 06 13 20 38 15 | 2467.871 |
| 2013 06 13 20 38 30 | 2467.872 |
| 2013 06 13 20 38 45 | 2467.871 |
| 2013 06 13 20 39 00 | 2467.869 |
| 2013 06 13 20 39 15 | 2467.868 |
| 2013 06 13 20 39 30 | 2467.867 |
| 2013 06 13 20 39 45 | 2467.867 |
| 2013 06 13 20 40 00 | 2467.866 |
| 2013 06 13 20 40 15 | 2467.866 |
| 2013 06 13 20 40 30 | 2467.865 |
| 2013 06 13 20 40 45 | 2467.864 |
| 2013 06 13 20 41 00 | 2467.863 |
| 2013 06 13 20 41 15 | 2467.861 |
| 2013 06 13 20 41 30 | 2467.861 |
| 2013 06 13 20 41 45 | 2467.861 |
| 2013 06 13 20 42 00 | 2467.861 |
| 2013 06 13 20 42 15 | 2467.861 |
| 2013 06 13 20 42 30 | 2467.861 |
| 2013 06 13 20 42 45 | 2467.861 |
| 2013 06 13 20 43 00 | 2467.861 |
| 2013 06 13 20 43 15 | 2467.86 |
| 2013 06 13 20 43 30 | 2467.859 |
| 2013 06 13 20 43 45 | 2467.859 |
| 2013 06 13 20 44 00 | 2467.859 |
| 2013 06 13 20 44 15 | 2467.86 |
| 2013 06 13 20 44 30 | 2467.86 |
| 2013 06 13 20 44 45 | 2467.86 |
| 2013 06 13 20 45 00 | 2467.861 |
| 2013 06 13 20 45 15 | 2467.861 |
| 2013 06 13 20 45 30 | 2467.861 |
| 2013 06 13 20 45 45 | 2467.861 |
| 2013 06 13 20 46 00 | 2467.862 |
| 2013 06 13 20 46 15 | 2467.863 |
| 2013 06 13 20 46 30 | 2467.863 |
| 2013 06 13 20 46 45 | 2467.863 |
| 2013 06 13 20 47 00 | 2467.863 |
| 2013 06 13 20 47 15 | 2467.863 |
| 2013 06 13 20 47 30 | 2467.863 |
| 2013 06 13 20 47 45 | 2467.864 |
| 2013 06 13 20 48 00 | 2467.864 |
| 2013 06 13 20 48 15 | 2467.864 |
| 2013 06 13 20 48 30 | 2467.863 |
| 2013 06 13 20 48 45 | 2467.863 |
| 2013 06 13 20 49 00 | 2467.862 |
| 2013 06 13 20 49 15 | 2467.862 |
| 2013 06 13 20 49 30 | 2467.861 |
| 2013 06 13 20 49 45 | 2467.861 |
| 2013 06 13 20 50 00 | 2467.861 |
| 2013 06 13 20 50 15 | 2467.862 |
| 2013 06 13 20 50 30 | 2467.862 |
| 2013 06 13 20 50 45 | 2467.862 |
| 2013 06 13 20 51 00 | 2467.862 |
| 2013 06 13 20 51 15 | 2467.862 |
| 2013 06 13 20 51 30 | 2467.862 |
| 2013 06 13 20 51 45 | 2467.862 |
| 2013 06 13 20 52 00 | 2467.862 |
| 2013 06 13 20 52 15 | 2467.862 |
| 2013 06 13 20 52 30 | 2467.862 |
| 2013 06 13 20 52 45 | 2467.862 |
| 2013 06 13 20 53 00 | 2467.862 |
| 2013 06 13 20 53 15 | 2467.863 |
| 2013 06 13 20 53 30 | 2467.863 |
| 2013 06 13 20 53 45 | 2467.864 |
| 2013 06 13 20 54 00 | 2467.864 |
| 2013 06 13 20 54 15 | 2467.864 |
| 2013 06 13 20 54 30 | 2467.863 |
| 2013 06 13 20 54 45 | 2467.863 |
| 2013 06 13 20 55 00 | 2467.862 |
| 2013 06 13 20 55 15 | 2467.861 |
| 2013 06 13 20 55 30 | 2467.861 |
| 2013 06 13 20 55 45 | 2467.86 |
| 2013 06 13 20 56 00 | 2467.86 |
| 2013 06 13 20 56 15 | 2467.859 |
| 2013 06 13 20 56 30 | 2467.859 |
| 2013 06 13 20 56 45 | 2467.858 |
| 2013 06 13 20 57 00 | 2467.858 |
| 2013 06 13 20 57 15 | 2467.859 |
| 2013 06 13 20 57 30 | 2467.86 |
| 2013 06 13 20 57 45 | 2467.86 |
| 2013 06 13 20 58 00 | 2467.861 |
| 2013 06 13 20 58 15 | 2467.862 |
| 2013 06 13 20 58 30 | 2467.862 |
| 2013 06 13 20 58 45 | 2467.862 |
| 2013 06 13 20 59 00 | 2467.862 |
| 2013 06 13 20 59 15 | 2467.861 |
| 2013 06 13 20 59 30 | 2467.861 |
| 2013 06 13 20 59 45 | 2467.86 |
| 2013 06 13 21 00 15 | 2467.86 |
| 2013 06 13 21 00 30 | 2467.86 |
| 2013 06 13 21 00 45 | 2467.861 |
| 2013 06 13 21 01 00 | 2467.862 |
| 2013 06 13 21 01 15 | 2467.862 |
| 2013 06 13 21 01 30 | 2467.861 |
| 2013 06 13 21 01 45 | 2467.86 |
| 2013 06 13 21 02 00 | 2467.86 |
| 2013 06 13 21 02 15 | 2467.859 |
| 2013 06 13 21 02 30 | 2467.858 |
| 2013 06 13 21 02 45 | 2467.857 |
| 2013 06 13 21 03 00 | 2467.856 |
| 2013 06 13 21 03 15 | 2467.856 |
| 2013 06 13 21 03 30 | 2467.855 |
| 2013 06 13 21 03 45 | 2467.855 |
| 2013 06 13 21 04 00 | 2467.854 |
| 2013 06 13 21 04 15 | 2467.853 |
| 2013 06 13 21 04 30 | 2467.852 |
| 2013 06 13 21 04 45 | 2467.851 |
| 2013 06 13 21 05 00 | 2467.85 |
| 2013 06 13 21 05 15 | 2467.849 |
| 2013 06 13 21 05 30 | 2467.848 |
| 2013 06 13 21 05 45 | 2467.847 |
| 2013 06 13 21 06 00 | 2467.847 |
| 2013 06 13 21 06 15 | 2467.847 |
| 2013 06 13 21 06 30 | 2467.846 |
| 2013 06 13 21 06 45 | 2467.846 |
| 2013 06 13 21 07 00 | 2467.846 |
| 2013 06 13 21 07 15 | 2467.846 |
| 2013 06 13 21 07 30 | 2467.846 |
| 2013 06 13 21 07 45 | 2467.847 |
| 2013 06 13 21 08 00 | 2467.847 |
| 2013 06 13 21 08 15 | 2467.848 |
| 2013 06 13 21 08 30 | 2467.848 |
| 2013 06 13 21 08 45 | 2467.848 |
| 2013 06 13 21 09 00 | 2467.847 |
| 2013 06 13 21 09 15 | 2467.847 |
| 2013 06 13 21 09 30 | 2467.847 |
| 2013 06 13 21 09 45 | 2467.847 |
| 2013 06 13 21 10 00 | 2467.848 |
| 2013 06 13 21 10 15 | 2467.848 |
| 2013 06 13 21 10 30 | 2467.849 |
| 2013 06 13 21 10 45 | 2467.849 |
| 2013 06 13 21 11 00 | 2467.851 |
| 2013 06 13 21 11 15 | 2467.851 |
| 2013 06 13 21 11 30 | 2467.852 |
| 2013 06 13 21 11 45 | 2467.852 |
| 2013 06 13 21 12 00 | 2467.852 |
| 2013 06 13 21 12 15 | 2467.852 |
| 2013 06 13 21 12 30 | 2467.852 |
| 2013 06 13 21 12 45 | 2467.853 |
| 2013 06 13 21 13 00 | 2467.854 |
| 2013 06 13 21 13 15 | 2467.855 |
| 2013 06 13 21 13 30 | 2467.856 |
| 2013 06 13 21 13 45 | 2467.856 |
| 2013 06 13 21 14 00 | 2467.855 |
| 2013 06 13 21 14 15 | 2467.854 |
| 2013 06 13 21 14 30 | 2467.854 |
| 2013 06 13 21 14 45 | 2467.854 |
| 2013 06 13 21 15 00 | 2467.854 |
| 2013 06 13 21 15 15 | 2467.852 |
| 2013 06 13 21 15 30 | 2467.851 |
| 2013 06 13 21 15 45 | 2467.85 |
| 2013 06 13 21 16 00 | 2467.849 |
| 2013 06 13 21 16 15 | 2467.848 |
| 2013 06 13 21 16 30 | 2467.847 |
| 2013 06 13 21 16 45 | 2467.847 |
| 2013 06 13 21 17 00 | 2467.846 |
| 2013 06 13 21 17 15 | 2467.845 |
| 2013 06 13 21 17 30 | 2467.844 |
| 2013 06 13 21 17 45 | 2467.844 |
| 2013 06 13 21 18 00 | 2467.845 |
| 2013 06 13 21 18 15 | 2467.845 |
| 2013 06 13 21 18 30 | 2467.847 |
| 2013 06 13 21 18 45 | 2467.848 |
| 2013 06 13 21 19 00 | 2467.848 |
| 2013 06 13 21 19 15 | 2467.849 |
| 2013 06 13 21 19 30 | 2467.85 |
| 2013 06 13 21 19 45 | 2467.85 |
| 2013 06 13 21 20 00 | 2467.851 |
| 2013 06 13 21 20 15 | 2467.851 |
| 2013 06 13 21 20 30 | 2467.851 |
| 2013 06 13 21 20 45 | 2467.85 |
| 2013 06 13 21 21 00 | 2467.849 |
| 2013 06 13 21 21 15 | 2467.85 |
| 2013 06 13 21 21 30 | 2467.85 |
| 2013 06 13 21 21 45 | 2467.851 |
| 2013 06 13 21 22 00 | 2467.852 |
| 2013 06 13 21 22 15 | 2467.854 |
| 2013 06 13 21 22 30 | 2467.854 |
| 2013 06 13 21 22 45 | 2467.853 |
| 2013 06 13 21 23 00 | 2467.853 |
| 2013 06 13 21 23 15 | 2467.853 |
| 2013 06 13 21 23 30 | 2467.853 |
| 2013 06 13 21 23 45 | 2467.852 |
| 2013 06 13 21 24 00 | 2467.852 |
| 2013 06 13 21 24 15 | 2467.853 |
| 2013 06 13 21 24 30 | 2467.854 |
| 2013 06 13 21 24 45 | 2467.856 |
| 2013 06 13 21 25 00 | 2467.856 |
| 2013 06 13 21 25 15 | 2467.857 |
| 2013 06 13 21 25 30 | 2467.858 |
| 2013 06 13 21 25 45 | 2467.859 |
| 2013 06 13 21 26 00 | 2467.86 |
| 2013 06 13 21 26 15 | 2467.861 |
| 2013 06 13 21 26 30 | 2467.862 |
| 2013 06 13 21 26 45 | 2467.863 |
| 2013 06 13 21 27 00 | 2467.864 |
| 2013 06 13 21 27 15 | 2467.865 |
| 2013 06 13 21 27 30 | 2467.867 |
| 2013 06 13 21 27 45 | 2467.868 |
| 2013 06 13 21 28 00 | 2467.869 |
| 2013 06 13 21 28 15 | 2467.87 |
| 2013 06 13 21 28 30 | 2467.87 |
| 2013 06 13 21 28 45 | 2467.87 |
| 2013 06 13 21 29 00 | 2467.87 |
| 2013 06 13 21 29 15 | 2467.87 |
| 2013 06 13 21 29 30 | 2467.87 |
| 2013 06 13 21 29 45 | 2467.869 |
| 2013 06 13 21 30 00 | 2467.869 |
| 2013 06 13 21 30 15 | 2467.869 |
| 2013 06 13 21 30 30 | 2467.87 |
| 2013 06 13 21 30 45 | 2467.87 |
| 2013 06 13 21 31 00 | 2467.87 |
| 2013 06 13 21 31 15 | 2467.871 |
| 2013 06 13 21 31 30 | 2467.871 |
| 2013 06 13 21 31 45 | 2467.871 |
| 2013 06 13 21 32 00 | 2467.871 |
| 2013 06 13 21 32 15 | 2467.87 |
| 2013 06 13 21 32 30 | 2467.869 |
| 2013 06 13 21 32 45 | 2467.869 |
| 2013 06 13 21 33 00 | 2467.868 |
| 2013 06 13 21 33 15 | 2467.868 |
| 2013 06 13 21 33 30 | 2467.867 |
| 2013 06 13 21 33 45 | 2467.867 |
| 2013 06 13 21 34 00 | 2467.867 |
| 2013 06 13 21 34 15 | 2467.866 |
| 2013 06 13 21 34 30 | 2467.865 |
| 2013 06 13 21 34 45 | 2467.865 |
| 2013 06 13 21 35 00 | 2467.867 |
| 2013 06 13 21 35 15 | 2467.867 |
| 2013 06 13 21 35 30 | 2467.867 |
| 2013 06 13 21 35 45 | 2467.867 |
| 2013 06 13 21 36 00 | 2467.867 |
| 2013 06 13 21 36 15 | 2467.868 |
| 2013 06 13 21 36 30 | 2467.869 |
| 2013 06 13 21 36 45 | 2467.868 |
| 2013 06 13 21 37 00 | 2467.868 |
| 2013 06 13 21 37 15 | 2467.869 |
| 2013 06 13 21 37 30 | 2467.869 |
| 2013 06 13 21 37 45 | 2467.869 |
| 2013 06 13 21 38 00 | 2467.869 |
| 2013 06 13 21 38 15 | 2467.869 |
| 2013 06 13 21 38 30 | 2467.869 |
| 2013 06 13 21 38 45 | 2467.869 |
| 2013 06 13 21 39 00 | 2467.868 |
| 2013 06 13 21 39 15 | 2467.868 |
| 2013 06 13 21 39 30 | 2467.867 |
| 2013 06 13 21 39 45 | 2467.867 |
| 2013 06 13 21 40 00 | 2467.867 |
| 2013 06 13 21 40 15 | 2467.867 |
| 2013 06 13 21 40 30 | 2467.868 |
| 2013 06 13 21 40 45 | 2467.868 |
| 2013 06 13 21 41 00 | 2467.869 |
| 2013 06 13 21 41 15 | 2467.87 |
| 2013 06 13 21 41 30 | 2467.87 |
| 2013 06 13 21 41 45 | 2467.872 |
| 2013 06 13 21 42 00 | 2467.873 |
| 2013 06 13 21 42 15 | 2467.873 |
| 2013 06 13 21 42 30 | 2467.874 |
| 2013 06 13 21 42 45 | 2467.875 |
| 2013 06 13 21 43 00 | 2467.876 |
| 2013 06 13 21 43 15 | 2467.878 |
| 2013 06 13 21 43 30 | 2467.878 |
| 2013 06 13 21 43 45 | 2467.878 |
| 2013 06 13 21 44 00 | 2467.877 |
| 2013 06 13 21 44 15 | 2467.877 |
| 2013 06 13 21 44 30 | 2467.878 |
| 2013 06 13 21 44 45 | 2467.879 |
| 2013 06 13 21 45 00 | 2467.879 |
| 2013 06 13 21 45 15 | 2467.879 |
| 2013 06 13 21 45 30 | 2467.88 |
| 2013 06 13 21 45 45 | 2467.88 |
| 2013 06 13 21 46 00 | 2467.88 |
| 2013 06 13 21 46 15 | 2467.88 |
| 2013 06 13 21 46 30 | 2467.879 |
| 2013 06 13 21 46 45 | 2467.878 |
| 2013 06 13 21 47 00 | 2467.876 |
| 2013 06 13 21 47 15 | 2467.876 |
| 2013 06 13 21 47 30 | 2467.876 |
| 2013 06 13 21 47 45 | 2467.876 |
| 2013 06 13 21 48 00 | 2467.877 |
| 2013 06 13 21 48 15 | 2467.877 |
| 2013 06 13 21 48 30 | 2467.876 |
| 2013 06 13 21 48 45 | 2467.876 |
| 2013 06 13 21 49 00 | 2467.876 |
| 2013 06 13 21 49 15 | 2467.876 |
| 2013 06 13 21 49 30 | 2467.876 |
| 2013 06 13 21 49 45 | 2467.876 |
| 2013 06 13 21 50 00 | 2467.876 |
| 2013 06 13 21 50 15 | 2467.876 |
| 2013 06 13 21 50 30 | 2467.876 |
| 2013 06 13 21 50 45 | 2467.876 |
| 2013 06 13 21 51 00 | 2467.877 |
| 2013 06 13 21 51 15 | 2467.878 |
| 2013 06 13 21 51 30 | 2467.878 |
| 2013 06 13 21 51 45 | 2467.879 |
| 2013 06 13 21 52 00 | 2467.88 |
| 2013 06 13 21 52 15 | 2467.88 |
| 2013 06 13 21 52 30 | 2467.881 |
| 2013 06 13 21 52 45 | 2467.881 |
| 2013 06 13 21 53 00 | 2467.882 |
| 2013 06 13 21 53 15 | 2467.883 |
| 2013 06 13 21 53 30 | 2467.883 |
| 2013 06 13 21 53 45 | 2467.884 |
| 2013 06 13 21 54 00 | 2467.885 |
| 2013 06 13 21 54 15 | 2467.887 |
| 2013 06 13 21 54 30 | 2467.888 |
| 2013 06 13 21 54 45 | 2467.889 |
| 2013 06 13 21 55 00 | 2467.889 |
| 2013 06 13 21 55 15 | 2467.89 |
| 2013 06 13 21 55 30 | 2467.891 |
| 2013 06 13 21 55 45 | 2467.892 |
| 2013 06 13 21 56 00 | 2467.893 |
| 2013 06 13 21 56 15 | 2467.893 |
| 2013 06 13 21 56 30 | 2467.893 |
| 2013 06 13 21 56 45 | 2467.893 |
| 2013 06 13 21 57 00 | 2467.893 |
| 2013 06 13 21 57 15 | 2467.893 |
| 2013 06 13 21 57 30 | 2467.893 |
| 2013 06 13 21 57 45 | 2467.893 |
| 2013 06 13 21 58 00 | 2467.893 |
| 2013 06 13 21 58 15 | 2467.894 |
| 2013 06 13 21 58 30 | 2467.894 |
| 2013 06 13 21 58 45 | 2467.895 |
| 2013 06 13 21 59 00 | 2467.896 |
| 2013 06 13 21 59 15 | 2467.898 |
| 2013 06 13 21 59 30 | 2467.898 |
| 2013 06 13 21 59 45 | 2467.898 |
| 2013 06 13 22 00 15 | 2467.899 |
| 2013 06 13 22 00 30 | 2467.9 |
| 2013 06 13 22 00 45 | 2467.9 |
| 2013 06 13 22 01 00 | 2467.9 |
| 2013 06 13 22 01 15 | 2467.901 |
| 2013 06 13 22 01 30 | 2467.9 |
| 2013 06 13 22 01 45 | 2467.899 |
| 2013 06 13 22 02 00 | 2467.899 |
| 2013 06 13 22 02 15 | 2467.899 |
| 2013 06 13 22 02 30 | 2467.899 |
| 2013 06 13 22 02 45 | 2467.899 |
| 2013 06 13 22 03 00 | 2467.899 |
| 2013 06 13 22 03 15 | 2467.899 |
| 2013 06 13 22 03 30 | 2467.899 |
| 2013 06 13 22 03 45 | 2467.9 |
| 2013 06 13 22 04 00 | 2467.9 |
| 2013 06 13 22 04 15 | 2467.901 |
| 2013 06 13 22 04 30 | 2467.902 |
| 2013 06 13 22 04 45 | 2467.903 |
| 2013 06 13 22 05 00 | 2467.904 |
| 2013 06 13 22 05 15 | 2467.905 |
| 2013 06 13 22 05 30 | 2467.905 |
| 2013 06 13 22 05 45 | 2467.904 |
| 2013 06 13 22 06 00 | 2467.905 |
| 2013 06 13 22 06 15 | 2467.904 |
| 2013 06 13 22 06 30 | 2467.905 |
| 2013 06 13 22 06 45 | 2467.905 |
| 2013 06 13 22 07 00 | 2467.904 |
| 2013 06 13 22 07 15 | 2467.905 |
| 2013 06 13 22 07 30 | 2467.905 |
| 2013 06 13 22 07 45 | 2467.906 |
| 2013 06 13 22 08 00 | 2467.907 |
| 2013 06 13 22 08 15 | 2467.907 |
| 2013 06 13 22 08 30 | 2467.907 |
| 2013 06 13 22 08 45 | 2467.907 |
| 2013 06 13 22 09 00 | 2467.908 |
| 2013 06 13 22 09 15 | 2467.909 |
| 2013 06 13 22 09 30 | 2467.909 |
| 2013 06 13 22 09 45 | 2467.909 |
| 2013 06 13 22 10 00 | 2467.91 |
| 2013 06 13 22 10 15 | 2467.91 |
| 2013 06 13 22 10 30 | 2467.911 |
| 2013 06 13 22 10 45 | 2467.911 |
| 2013 06 13 22 11 00 | 2467.911 |
| 2013 06 13 22 11 15 | 2467.911 |
| 2013 06 13 22 11 30 | 2467.911 |
| 2013 06 13 22 11 45 | 2467.911 |
| 2013 06 13 22 12 00 | 2467.912 |
| 2013 06 13 22 12 15 | 2467.913 |
| 2013 06 13 22 12 30 | 2467.913 |
| 2013 06 13 22 12 45 | 2467.914 |
| 2013 06 13 22 13 00 | 2467.914 |
| 2013 06 13 22 13 15 | 2467.914 |
| 2013 06 13 22 13 30 | 2467.914 |
| 2013 06 13 22 13 45 | 2467.915 |
| 2013 06 13 22 14 00 | 2467.916 |
| 2013 06 13 22 14 15 | 2467.916 |
| 2013 06 13 22 14 30 | 2467.916 |
| 2013 06 13 22 14 45 | 2467.917 |
| 2013 06 13 22 15 00 | 2467.917 |
| 2013 06 13 22 15 15 | 2467.918 |
| 2013 06 13 22 15 30 | 2467.918 |
| 2013 06 13 22 15 45 | 2467.919 |
| 2013 06 13 22 16 00 | 2467.919 |
| 2013 06 13 22 16 15 | 2467.919 |
| 2013 06 13 22 16 30 | 2467.92 |
| 2013 06 13 22 16 45 | 2467.92 |
| 2013 06 13 22 17 00 | 2467.921 |
| 2013 06 13 22 17 15 | 2467.921 |
| 2013 06 13 22 17 30 | 2467.921 |
| 2013 06 13 22 17 45 | 2467.92 |
| 2013 06 13 22 18 00 | 2467.92 |
| 2013 06 13 22 18 15 | 2467.92 |
| 2013 06 13 22 18 30 | 2467.919 |
| 2013 06 13 22 18 45 | 2467.919 |
| 2013 06 13 22 19 00 | 2467.919 |
| 2013 06 13 22 19 15 | 2467.92 |
| 2013 06 13 22 19 30 | 2467.921 |
| 2013 06 13 22 19 45 | 2467.921 |
| 2013 06 13 22 20 00 | 2467.922 |
| 2013 06 13 22 20 15 | 2467.922 |
| 2013 06 13 22 20 30 | 2467.923 |
| 2013 06 13 22 20 45 | 2467.924 |
| 2013 06 13 22 21 00 | 2467.925 |
| 2013 06 13 22 21 15 | 2467.925 |
| 2013 06 13 22 21 30 | 2467.926 |
| 2013 06 13 22 21 45 | 2467.927 |
| 2013 06 13 22 22 00 | 2467.927 |
| 2013 06 13 22 22 15 | 2467.927 |
| 2013 06 13 22 22 30 | 2467.928 |
| 2013 06 13 22 22 45 | 2467.928 |
| 2013 06 13 22 23 00 | 2467.928 |
| 2013 06 13 22 23 15 | 2467.929 |
| 2013 06 13 22 23 30 | 2467.93 |
| 2013 06 13 22 23 45 | 2467.931 |
| 2013 06 13 22 24 00 | 2467.93 |
| 2013 06 13 22 24 15 | 2467.931 |
| 2013 06 13 22 24 30 | 2467.93 |
| 2013 06 13 22 24 45 | 2467.93 |
| 2013 06 13 22 25 00 | 2467.93 |
| 2013 06 13 22 25 15 | 2467.93 |
| 2013 06 13 22 25 30 | 2467.93 |
| 2013 06 13 22 25 45 | 2467.931 |
| 2013 06 13 22 26 00 | 2467.932 |
| 2013 06 13 22 26 15 | 2467.932 |
| 2013 06 13 22 26 30 | 2467.932 |
| 2013 06 13 22 26 45 | 2467.932 |
| 2013 06 13 22 27 00 | 2467.932 |
| 2013 06 13 22 27 15 | 2467.933 |
| 2013 06 13 22 27 30 | 2467.933 |
| 2013 06 13 22 27 45 | 2467.933 |
| 2013 06 13 22 28 00 | 2467.934 |
| 2013 06 13 22 28 15 | 2467.934 |
| 2013 06 13 22 28 30 | 2467.935 |
| 2013 06 13 22 28 45 | 2467.936 |
| 2013 06 13 22 29 00 | 2467.937 |
| 2013 06 13 22 29 15 | 2467.938 |
| 2013 06 13 22 29 30 | 2467.938 |
| 2013 06 13 22 29 45 | 2467.939 |
| 2013 06 13 22 30 00 | 2467.939 |
| 2013 06 13 22 30 15 | 2467.939 |
| 2013 06 13 22 30 30 | 2467.939 |
| 2013 06 13 22 30 45 | 2467.941 |
| 2013 06 13 22 31 00 | 2467.942 |
| 2013 06 13 22 31 15 | 2467.943 |
| 2013 06 13 22 31 30 | 2467.943 |
| 2013 06 13 22 31 45 | 2467.943 |
| 2013 06 13 22 32 00 | 2467.944 |
| 2013 06 13 22 32 15 | 2467.945 |
| 2013 06 13 22 32 30 | 2467.946 |
| 2013 06 13 22 32 45 | 2467.946 |
| 2013 06 13 22 33 00 | 2467.947 |
| 2013 06 13 22 33 15 | 2467.947 |
| 2013 06 13 22 33 30 | 2467.947 |
| 2013 06 13 22 33 45 | 2467.947 |
| 2013 06 13 22 34 00 | 2467.948 |
| 2013 06 13 22 34 15 | 2467.948 |
| 2013 06 13 22 34 30 | 2467.948 |
| 2013 06 13 22 34 45 | 2467.948 |
| 2013 06 13 22 35 00 | 2467.948 |
| 2013 06 13 22 35 15 | 2467.949 |
| 2013 06 13 22 35 30 | 2467.949 |
| 2013 06 13 22 35 45 | 2467.95 |
| 2013 06 13 22 36 00 | 2467.95 |
| 2013 06 13 22 36 15 | 2467.951 |
| 2013 06 13 22 36 30 | 2467.951 |
| 2013 06 13 22 36 45 | 2467.952 |
| 2013 06 13 22 37 00 | 2467.952 |
| 2013 06 13 22 37 15 | 2467.952 |
| 2013 06 13 22 37 30 | 2467.953 |
| 2013 06 13 22 37 45 | 2467.953 |
| 2013 06 13 22 38 00 | 2467.954 |
| 2013 06 13 22 38 15 | 2467.955 |
| 2013 06 13 22 38 30 | 2467.956 |
| 2013 06 13 22 38 45 | 2467.956 |
| 2013 06 13 22 39 00 | 2467.957 |
| 2013 06 13 22 39 15 | 2467.958 |
| 2013 06 13 22 39 30 | 2467.959 |
| 2013 06 13 22 39 45 | 2467.96 |
| 2013 06 13 22 40 00 | 2467.961 |
| 2013 06 13 22 40 15 | 2467.962 |
| 2013 06 13 22 40 30 | 2467.964 |
| 2013 06 13 22 40 45 | 2467.965 |
| 2013 06 13 22 41 00 | 2467.966 |
| 2013 06 13 22 41 15 | 2467.966 |
| 2013 06 13 22 41 30 | 2467.967 |
| 2013 06 13 22 41 45 | 2467.968 |
| 2013 06 13 22 42 00 | 2467.969 |
| 2013 06 13 22 42 15 | 2467.97 |
| 2013 06 13 22 42 30 | 2467.97 |
| 2013 06 13 22 42 45 | 2467.97 |
| 2013 06 13 22 43 00 | 2467.971 |
| 2013 06 13 22 43 15 | 2467.971 |
| 2013 06 13 22 43 30 | 2467.971 |
| 2013 06 13 22 43 45 | 2467.972 |
| 2013 06 13 22 44 00 | 2467.972 |
| 2013 06 13 22 44 15 | 2467.974 |
| 2013 06 13 22 44 30 | 2467.975 |
| 2013 06 13 22 44 45 | 2467.975 |
| 2013 06 13 22 45 00 | 2467.975 |
| 2013 06 13 22 45 15 | 2467.975 |
| 2013 06 13 22 45 30 | 2467.976 |
| 2013 06 13 22 45 45 | 2467.976 |
| 2013 06 13 22 46 00 | 2467.976 |
| 2013 06 13 22 46 15 | 2467.976 |
| 2013 06 13 22 46 30 | 2467.976 |
| 2013 06 13 22 46 45 | 2467.975 |
| 2013 06 13 22 47 00 | 2467.976 |
| 2013 06 13 22 47 15 | 2467.976 |
| 2013 06 13 22 47 30 | 2467.976 |
| 2013 06 13 22 47 45 | 2467.975 |
| 2013 06 13 22 48 00 | 2467.976 |
| 2013 06 13 22 48 15 | 2467.977 |
| 2013 06 13 22 48 30 | 2467.977 |
| 2013 06 13 22 48 45 | 2467.978 |
| 2013 06 13 22 49 00 | 2467.977 |
| 2013 06 13 22 49 15 | 2467.979 |
| 2013 06 13 22 49 30 | 2467.979 |
| 2013 06 13 22 49 45 | 2467.98 |
| 2013 06 13 22 50 00 | 2467.98 |
| 2013 06 13 22 50 15 | 2467.981 |
| 2013 06 13 22 50 30 | 2467.982 |
| 2013 06 13 22 50 45 | 2467.983 |
| 2013 06 13 22 51 00 | 2467.984 |
| 2013 06 13 22 51 15 | 2467.985 |
| 2013 06 13 22 51 30 | 2467.986 |
| 2013 06 13 22 51 45 | 2467.987 |
| 2013 06 13 22 52 00 | 2467.988 |
| 2013 06 13 22 52 15 | 2467.989 |
| 2013 06 13 22 52 30 | 2467.99 |
| 2013 06 13 22 52 45 | 2467.99 |
| 2013 06 13 22 53 00 | 2467.992 |
| 2013 06 13 22 53 15 | 2467.992 |
| 2013 06 13 22 53 30 | 2467.993 |
| 2013 06 13 22 53 45 | 2467.994 |
| 2013 06 13 22 54 00 | 2467.995 |
| 2013 06 13 22 54 15 | 2467.996 |
| 2013 06 13 22 54 30 | 2467.996 |
| 2013 06 13 22 54 45 | 2467.997 |
| 2013 06 13 22 55 00 | 2467.998 |
| 2013 06 13 22 55 15 | 2467.998 |
| 2013 06 13 22 55 30 | 2467.999 |
| 2013 06 13 22 55 45 | 2468 |
| 2013 06 13 22 56 00 | 2468.001 |
| 2013 06 13 22 56 15 | 2468.002 |
| 2013 06 13 22 56 30 | 2468.003 |
| 2013 06 13 22 56 45 | 2468.004 |
| 2013 06 13 22 57 00 | 2468.005 |
| 2013 06 13 22 57 15 | 2468.006 |
| 2013 06 13 22 57 30 | 2468.007 |
| 2013 06 13 22 57 45 | 2468.008 |
| 2013 06 13 22 58 00 | 2468.01 |
| 2013 06 13 22 58 15 | 2468.01 |
| 2013 06 13 22 58 30 | 2468.012 |
| 2013 06 13 22 58 45 | 2468.013 |
| 2013 06 13 22 59 00 | 2468.015 |
| 2013 06 13 22 59 15 | 2468.016 |
| 2013 06 13 22 59 30 | 2468.017 |
| 2013 06 13 22 59 45 | 2468.017 |
| 2013 06 13 23 00 15 | 2468.018 |
| 2013 06 13 23 00 30 | 2468.018 |
| 2013 06 13 23 00 45 | 2468.017 |
| 2013 06 13 23 01 00 | 2468.017 |
| 2013 06 13 23 01 15 | 2468.016 |
| 2013 06 13 23 01 30 | 2468.015 |
| 2013 06 13 23 01 45 | 2468.015 |
| 2013 06 13 23 02 00 | 2468.015 |
| 2013 06 13 23 02 15 | 2468.015 |
| 2013 06 13 23 02 30 | 2468.014 |
| 2013 06 13 23 02 45 | 2468.015 |
| 2013 06 13 23 03 00 | 2468.015 |
| 2013 06 13 23 03 15 | 2468.017 |
| 2013 06 13 23 03 30 | 2468.018 |
| 2013 06 13 23 03 45 | 2468.02 |
| 2013 06 13 23 04 00 | 2468.022 |
| 2013 06 13 23 04 15 | 2468.023 |
| 2013 06 13 23 04 30 | 2468.025 |
| 2013 06 13 23 04 45 | 2468.027 |
| 2013 06 13 23 05 00 | 2468.028 |
| 2013 06 13 23 05 15 | 2468.028 |
| 2013 06 13 23 05 30 | 2468.029 |
| 2013 06 13 23 05 45 | 2468.029 |
| 2013 06 13 23 06 00 | 2468.028 |
| 2013 06 13 23 06 15 | 2468.028 |
| 2013 06 13 23 06 30 | 2468.029 |
| 2013 06 13 23 06 45 | 2468.03 |
| 2013 06 13 23 07 00 | 2468.032 |
| 2013 06 13 23 07 15 | 2468.033 |
| 2013 06 13 23 07 30 | 2468.035 |
| 2013 06 13 23 07 45 | 2468.037 |
| 2013 06 13 23 08 00 | 2468.039 |
| 2013 06 13 23 08 15 | 2468.039 |
| 2013 06 13 23 08 30 | 2468.04 |
| 2013 06 13 23 08 45 | 2468.04 |
| 2013 06 13 23 09 00 | 2468.041 |
| 2013 06 13 23 09 15 | 2468.041 |
| 2013 06 13 23 09 30 | 2468.043 |
| 2013 06 13 23 09 45 | 2468.044 |
| 2013 06 13 23 10 00 | 2468.045 |
| 2013 06 13 23 10 15 | 2468.046 |
| 2013 06 13 23 10 30 | 2468.047 |
| 2013 06 13 23 10 45 | 2468.047 |
| 2013 06 13 23 11 00 | 2468.047 |
| 2013 06 13 23 11 15 | 2468.047 |
| 2013 06 13 23 11 30 | 2468.047 |
| 2013 06 13 23 11 45 | 2468.048 |
| 2013 06 13 23 12 00 | 2468.049 |
| 2013 06 13 23 12 15 | 2468.05 |
| 2013 06 13 23 12 30 | 2468.051 |
| 2013 06 13 23 12 45 | 2468.052 |
| 2013 06 13 23 13 00 | 2468.053 |
| 2013 06 13 23 13 15 | 2468.053 |
| 2013 06 13 23 13 30 | 2468.053 |
| 2013 06 13 23 13 45 | 2468.054 |
| 2013 06 13 23 14 00 | 2468.055 |
| 2013 06 13 23 14 15 | 2468.055 |
| 2013 06 13 23 14 30 | 2468.056 |
| 2013 06 13 23 14 45 | 2468.056 |
| 2013 06 13 23 15 00 | 2468.056 |
| 2013 06 13 23 15 15 | 2468.057 |
| 2013 06 13 23 15 30 | 2468.057 |
| 2013 06 13 23 15 45 | 2468.058 |
| 2013 06 13 23 16 00 | 2468.059 |
| 2013 06 13 23 16 15 | 2468.059 |
| 2013 06 13 23 16 30 | 2468.06 |
| 2013 06 13 23 16 45 | 2468.062 |
| 2013 06 13 23 17 00 | 2468.063 |
| 2013 06 13 23 17 15 | 2468.063 |
| 2013 06 13 23 17 30 | 2468.064 |
| 2013 06 13 23 17 45 | 2468.066 |
| 2013 06 13 23 18 00 | 2468.068 |
| 2013 06 13 23 18 15 | 2468.068 |
| 2013 06 13 23 18 30 | 2468.069 |
| 2013 06 13 23 18 45 | 2468.07 |
| 2013 06 13 23 19 00 | 2468.071 |
| 2013 06 13 23 19 15 | 2468.073 |
| 2013 06 13 23 19 30 | 2468.074 |
| 2013 06 13 23 19 45 | 2468.075 |
| 2013 06 13 23 20 00 | 2468.077 |
| 2013 06 13 23 20 15 | 2468.077 |
| 2013 06 13 23 20 30 | 2468.079 |
| 2013 06 13 23 20 45 | 2468.079 |
| 2013 06 13 23 21 00 | 2468.08 |
| 2013 06 13 23 21 15 | 2468.08 |
| 2013 06 13 23 21 30 | 2468.08 |
| 2013 06 13 23 21 45 | 2468.08 |
| 2013 06 13 23 22 00 | 2468.08 |
| 2013 06 13 23 22 15 | 2468.079 |
| 2013 06 13 23 22 30 | 2468.08 |
| 2013 06 13 23 22 45 | 2468.08 |
| 2013 06 13 23 23 00 | 2468.081 |
| 2013 06 13 23 23 15 | 2468.082 |
| 2013 06 13 23 23 30 | 2468.083 |
| 2013 06 13 23 23 45 | 2468.084 |
| 2013 06 13 23 24 00 | 2468.086 |
| 2013 06 13 23 24 15 | 2468.087 |
| 2013 06 13 23 24 30 | 2468.088 |
| 2013 06 13 23 24 45 | 2468.089 |
| 2013 06 13 23 25 00 | 2468.089 |
| 2013 06 13 23 25 15 | 2468.089 |
| 2013 06 13 23 25 30 | 2468.089 |
| 2013 06 13 23 25 45 | 2468.089 |
| 2013 06 13 23 26 00 | 2468.088 |
| 2013 06 13 23 26 15 | 2468.088 |
| 2013 06 13 23 26 30 | 2468.088 |
| 2013 06 13 23 26 45 | 2468.089 |
| 2013 06 13 23 27 00 | 2468.09 |
| 2013 06 13 23 27 15 | 2468.091 |
| 2013 06 13 23 27 30 | 2468.093 |
| 2013 06 13 23 27 45 | 2468.094 |
| 2013 06 13 23 28 00 | 2468.095 |
| 2013 06 13 23 28 15 | 2468.097 |
| 2013 06 13 23 28 30 | 2468.098 |
| 2013 06 13 23 28 45 | 2468.099 |
| 2013 06 13 23 29 00 | 2468.099 |
| 2013 06 13 23 29 15 | 2468.099 |
| 2013 06 13 23 29 30 | 2468.099 |
| 2013 06 13 23 29 45 | 2468.1 |
| 2013 06 13 23 30 00 | 2468.1 |
| 2013 06 13 23 30 15 | 2468.1 |
| 2013 06 13 23 30 30 | 2468.101 |
| 2013 06 13 23 30 45 | 2468.102 |
| 2013 06 13 23 31 00 | 2468.102 |
| 2013 06 13 23 31 15 | 2468.103 |
| 2013 06 13 23 31 30 | 2468.104 |
| 2013 06 13 23 31 45 | 2468.104 |
| 2013 06 13 23 32 00 | 2468.106 |
| 2013 06 13 23 32 15 | 2468.106 |
| 2013 06 13 23 32 30 | 2468.107 |
| 2013 06 13 23 32 45 | 2468.107 |
| 2013 06 13 23 33 00 | 2468.107 |
| 2013 06 13 23 33 15 | 2468.108 |
| 2013 06 13 23 33 30 | 2468.109 |
| 2013 06 13 23 33 45 | 2468.11 |
| 2013 06 13 23 34 00 | 2468.112 |
| 2013 06 13 23 34 15 | 2468.112 |
| 2013 06 13 23 34 30 | 2468.112 |
| 2013 06 13 23 34 45 | 2468.112 |
| 2013 06 13 23 35 00 | 2468.112 |
| 2013 06 13 23 35 15 | 2468.113 |
| 2013 06 13 23 35 30 | 2468.114 |
| 2013 06 13 23 35 45 | 2468.114 |
| 2013 06 13 23 36 00 | 2468.114 |
| 2013 06 13 23 36 15 | 2468.115 |
| 2013 06 13 23 36 30 | 2468.116 |
| 2013 06 13 23 36 45 | 2468.117 |
| 2013 06 13 23 37 00 | 2468.118 |
| 2013 06 13 23 37 15 | 2468.118 |
| 2013 06 13 23 37 30 | 2468.119 |
| 2013 06 13 23 37 45 | 2468.12 |
| 2013 06 13 23 38 00 | 2468.121 |
| 2013 06 13 23 38 15 | 2468.122 |
| 2013 06 13 23 38 30 | 2468.123 |
| 2013 06 13 23 38 45 | 2468.124 |
| 2013 06 13 23 39 00 | 2468.124 |
| 2013 06 13 23 39 15 | 2468.125 |
| 2013 06 13 23 39 30 | 2468.126 |
| 2013 06 13 23 39 45 | 2468.126 |
| 2013 06 13 23 40 00 | 2468.126 |
| 2013 06 13 23 40 15 | 2468.126 |
| 2013 06 13 23 40 30 | 2468.126 |
| 2013 06 13 23 40 45 | 2468.128 |
| 2013 06 13 23 41 00 | 2468.129 |
| 2013 06 13 23 41 15 | 2468.13 |
| 2013 06 13 23 41 30 | 2468.131 |
| 2013 06 13 23 41 45 | 2468.132 |
| 2013 06 13 23 42 00 | 2468.133 |
| 2013 06 13 23 42 15 | 2468.134 |
| 2013 06 13 23 42 30 | 2468.133 |
| 2013 06 13 23 42 45 | 2468.134 |
| 2013 06 13 23 43 00 | 2468.135 |
| 2013 06 13 23 43 15 | 2468.136 |
| 2013 06 13 23 43 30 | 2468.137 |
| 2013 06 13 23 43 45 | 2468.138 |
| 2013 06 13 23 44 00 | 2468.139 |
| 2013 06 13 23 44 15 | 2468.139 |
| 2013 06 13 23 44 30 | 2468.139 |
| 2013 06 13 23 44 45 | 2468.139 |
| 2013 06 13 23 45 00 | 2468.14 |
| 2013 06 13 23 45 15 | 2468.14 |
| 2013 06 13 23 45 30 | 2468.141 |
| 2013 06 13 23 45 45 | 2468.142 |
| 2013 06 13 23 46 00 | 2468.142 |
| 2013 06 13 23 46 15 | 2468.142 |
| 2013 06 13 23 46 30 | 2468.143 |
| 2013 06 13 23 46 45 | 2468.144 |
| 2013 06 13 23 47 00 | 2468.144 |
| 2013 06 13 23 47 15 | 2468.146 |
| 2013 06 13 23 47 30 | 2468.146 |
| 2013 06 13 23 47 45 | 2468.146 |
| 2013 06 13 23 48 00 | 2468.148 |
| 2013 06 13 23 48 15 | 2468.149 |
| 2013 06 13 23 48 30 | 2468.149 |
| 2013 06 13 23 48 45 | 2468.15 |
| 2013 06 13 23 49 00 | 2468.151 |
| 2013 06 13 23 49 15 | 2468.152 |
| 2013 06 13 23 49 30 | 2468.152 |
| 2013 06 13 23 49 45 | 2468.154 |
| 2013 06 13 23 50 00 | 2468.155 |
| 2013 06 13 23 50 15 | 2468.156 |
| 2013 06 13 23 50 30 | 2468.157 |
| 2013 06 13 23 50 45 | 2468.157 |
| 2013 06 13 23 51 00 | 2468.157 |
| 2013 06 13 23 51 15 | 2468.158 |
| 2013 06 13 23 51 30 | 2468.16 |
| 2013 06 13 23 51 45 | 2468.161 |
| 2013 06 13 23 52 00 | 2468.162 |
| 2013 06 13 23 52 15 | 2468.162 |
| 2013 06 13 23 52 30 | 2468.163 |
| 2013 06 13 23 52 45 | 2468.163 |
| 2013 06 13 23 53 00 | 2468.165 |
| 2013 06 13 23 53 15 | 2468.166 |
| 2013 06 13 23 53 30 | 2468.167 |
| 2013 06 13 23 53 45 | 2468.168 |
| 2013 06 13 23 54 00 | 2468.168 |
| 2013 06 13 23 54 15 | 2468.168 |
| 2013 06 13 23 54 30 | 2468.168 |
| 2013 06 13 23 54 45 | 2468.168 |
| 2013 06 13 23 55 00 | 2468.168 |
| 2013 06 13 23 55 15 | 2468.168 |
| 2013 06 13 23 55 30 | 2468.169 |
| 2013 06 13 23 55 45 | 2468.169 |
| 2013 06 13 23 56 00 | 2468.17 |
| 2013 06 13 23 56 15 | 2468.171 |
| 2013 06 13 23 56 30 | 2468.171 |
| 2013 06 13 23 56 45 | 2468.173 |
| 2013 06 13 23 57 00 | 2468.174 |
| 2013 06 13 23 57 15 | 2468.175 |
| 2013 06 13 23 57 30 | 2468.176 |
| 2013 06 13 23 57 45 | 2468.177 |
| 2013 06 13 23 58 00 | 2468.177 |
| 2013 06 13 23 58 15 | 2468.177 |
| 2013 06 13 23 58 30 | 2468.177 |
| 2013 06 13 23 58 45 | 2468.178 |
| 2013 06 13 23 59 00 | 2468.179 |
| 2013 06 13 23 59 15 | 2468.18 |
| 2013 06 13 23 59 30 | 2468.181 |
| 2013 06 13 23 59 45 | 2468.182 |